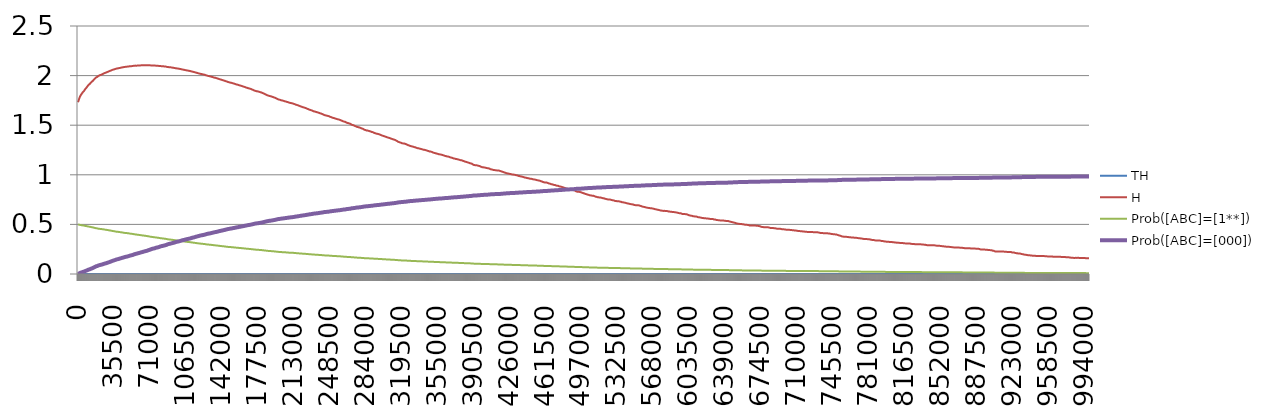
| Category | TH | H | Prob([ABC]=[1**]) | Prob([ABC]=[000]) |
|---|---|---|---|---|
| 0 | 0 | 1.732 | 0.499 | 0.001 |
| 500 | 0 | 1.746 | 0.499 | 0.003 |
| 1000 | 0 | 1.762 | 0.497 | 0.006 |
| 1500 | 0 | 1.777 | 0.496 | 0.008 |
| 2000 | 0 | 1.79 | 0.495 | 0.011 |
| 2500 | 0 | 1.797 | 0.494 | 0.012 |
| 3000 | 0 | 1.806 | 0.493 | 0.014 |
| 3500 | 0 | 1.813 | 0.492 | 0.016 |
| 4000 | 0 | 1.822 | 0.491 | 0.018 |
| 4500 | 0 | 1.83 | 0.49 | 0.02 |
| 5000 | 0 | 1.835 | 0.49 | 0.022 |
| 5500 | 0 | 1.84 | 0.488 | 0.023 |
| 6000 | 0 | 1.846 | 0.488 | 0.025 |
| 6500 | 0 | 1.854 | 0.487 | 0.027 |
| 7000 | 0 | 1.862 | 0.485 | 0.029 |
| 7500 | 0 | 1.87 | 0.484 | 0.032 |
| 8000 | 0 | 1.874 | 0.484 | 0.033 |
| 8500 | 0 | 1.881 | 0.483 | 0.035 |
| 9000 | 0 | 1.887 | 0.482 | 0.037 |
| 9500 | 0 | 1.894 | 0.48 | 0.039 |
| 10000 | 0 | 1.901 | 0.479 | 0.042 |
| 10500 | 0 | 1.907 | 0.478 | 0.044 |
| 11000 | 0 | 1.911 | 0.477 | 0.046 |
| 11500 | 0 | 1.915 | 0.477 | 0.047 |
| 12000 | 0 | 1.92 | 0.476 | 0.049 |
| 12500 | 0 | 1.925 | 0.474 | 0.052 |
| 13000 | 0 | 1.932 | 0.473 | 0.054 |
| 13500 | 0 | 1.936 | 0.472 | 0.056 |
| 14000 | 0 | 1.941 | 0.471 | 0.058 |
| 14500 | 0 | 1.946 | 0.471 | 0.06 |
| 15000 | 0 | 1.951 | 0.469 | 0.062 |
| 15500 | 0 | 1.956 | 0.468 | 0.065 |
| 16000 | 0 | 1.964 | 0.466 | 0.068 |
| 16500 | 0 | 1.968 | 0.464 | 0.071 |
| 17000 | 0 | 1.973 | 0.463 | 0.073 |
| 17500 | 0 | 1.978 | 0.462 | 0.076 |
| 18000 | 0 | 1.982 | 0.461 | 0.078 |
| 18500 | 0 | 1.985 | 0.461 | 0.079 |
| 19000 | 0 | 1.987 | 0.46 | 0.081 |
| 19500 | 0 | 1.993 | 0.458 | 0.084 |
| 20000 | 0 | 1.996 | 0.457 | 0.085 |
| 20500 | 0 | 1.998 | 0.456 | 0.087 |
| 21000 | 0 | 2.001 | 0.455 | 0.089 |
| 21500 | 0 | 2.004 | 0.456 | 0.09 |
| 22000 | 0 | 2.006 | 0.454 | 0.091 |
| 22500 | 0 | 2.007 | 0.454 | 0.092 |
| 23000 | 0 | 2.009 | 0.454 | 0.094 |
| 23500 | 0 | 2.011 | 0.452 | 0.095 |
| 24000 | 0 | 2.014 | 0.451 | 0.097 |
| 24500 | 0 | 2.017 | 0.451 | 0.098 |
| 25000 | 0 | 2.019 | 0.45 | 0.1 |
| 25500 | 0 | 2.022 | 0.45 | 0.102 |
| 26000 | 0 | 2.025 | 0.448 | 0.104 |
| 26500 | 0 | 2.027 | 0.447 | 0.106 |
| 27000 | 0 | 2.028 | 0.447 | 0.107 |
| 27500 | 0 | 2.03 | 0.446 | 0.108 |
| 28000 | 0 | 2.031 | 0.446 | 0.109 |
| 28500 | 0 | 2.035 | 0.444 | 0.112 |
| 29000 | 0 | 2.037 | 0.443 | 0.113 |
| 29500 | 0 | 2.039 | 0.443 | 0.115 |
| 30000 | 0 | 2.04 | 0.442 | 0.116 |
| 30500 | 0 | 2.043 | 0.441 | 0.119 |
| 31000 | 0 | 2.045 | 0.44 | 0.12 |
| 31500 | 0 | 2.047 | 0.439 | 0.122 |
| 32000 | 0 | 2.049 | 0.438 | 0.124 |
| 32500 | 0 | 2.052 | 0.436 | 0.127 |
| 33000 | 0 | 2.053 | 0.436 | 0.128 |
| 33500 | 0 | 2.056 | 0.435 | 0.13 |
| 34000 | 0 | 2.058 | 0.434 | 0.133 |
| 34500 | 0 | 2.059 | 0.434 | 0.134 |
| 35000 | 0 | 2.061 | 0.432 | 0.135 |
| 35500 | 0 | 2.062 | 0.431 | 0.137 |
| 36000 | 0 | 2.064 | 0.431 | 0.139 |
| 36500 | 0 | 2.065 | 0.43 | 0.141 |
| 37000 | 0 | 2.067 | 0.429 | 0.143 |
| 37500 | 0 | 2.069 | 0.428 | 0.144 |
| 38000 | 0 | 2.071 | 0.426 | 0.147 |
| 38500 | 0 | 2.072 | 0.426 | 0.148 |
| 39000 | 0 | 2.073 | 0.426 | 0.149 |
| 39500 | 0 | 2.073 | 0.425 | 0.15 |
| 40000 | 0 | 2.075 | 0.424 | 0.151 |
| 40500 | 0 | 2.076 | 0.423 | 0.153 |
| 41000 | 0 | 2.077 | 0.423 | 0.155 |
| 41500 | 0 | 2.078 | 0.422 | 0.156 |
| 42000 | 0 | 2.079 | 0.421 | 0.158 |
| 42500 | 0 | 2.08 | 0.42 | 0.159 |
| 43000 | 0 | 2.082 | 0.42 | 0.161 |
| 43500 | 0 | 2.082 | 0.418 | 0.162 |
| 44000 | 0 | 2.083 | 0.418 | 0.164 |
| 44500 | 0 | 2.084 | 0.417 | 0.165 |
| 45000 | 0 | 2.086 | 0.416 | 0.167 |
| 45500 | 0 | 2.086 | 0.416 | 0.168 |
| 46000 | 0 | 2.087 | 0.414 | 0.17 |
| 46500 | 0 | 2.088 | 0.414 | 0.172 |
| 47000 | 0 | 2.088 | 0.414 | 0.173 |
| 47500 | 0 | 2.09 | 0.413 | 0.174 |
| 48000 | 0 | 2.09 | 0.413 | 0.175 |
| 48500 | 0 | 2.09 | 0.412 | 0.176 |
| 49000 | 0 | 2.091 | 0.411 | 0.177 |
| 49500 | 0 | 2.092 | 0.41 | 0.179 |
| 50000 | 0 | 2.092 | 0.41 | 0.181 |
| 50500 | 0 | 2.093 | 0.408 | 0.183 |
| 51000 | 0 | 2.094 | 0.408 | 0.184 |
| 51500 | 0 | 2.094 | 0.407 | 0.185 |
| 52000 | 0 | 2.095 | 0.406 | 0.187 |
| 52500 | 0 | 2.096 | 0.406 | 0.188 |
| 53000 | 0 | 2.095 | 0.406 | 0.189 |
| 53500 | 0 | 2.096 | 0.405 | 0.19 |
| 54000 | 0 | 2.098 | 0.404 | 0.192 |
| 54500 | 0 | 2.098 | 0.403 | 0.194 |
| 55000 | 0 | 2.098 | 0.402 | 0.196 |
| 55500 | 0 | 2.099 | 0.4 | 0.198 |
| 56000 | 0 | 2.1 | 0.4 | 0.2 |
| 56500 | 0 | 2.1 | 0.399 | 0.202 |
| 57000 | 0 | 2.101 | 0.398 | 0.203 |
| 57500 | 0 | 2.101 | 0.398 | 0.204 |
| 58000 | 0 | 2.1 | 0.397 | 0.205 |
| 58500 | 0 | 2.101 | 0.396 | 0.207 |
| 59000 | 0 | 2.102 | 0.396 | 0.208 |
| 59500 | 0 | 2.102 | 0.395 | 0.21 |
| 60000 | 0 | 2.102 | 0.394 | 0.211 |
| 60500 | 0 | 2.102 | 0.394 | 0.213 |
| 61000 | 0 | 2.102 | 0.393 | 0.214 |
| 61500 | 0 | 2.103 | 0.392 | 0.215 |
| 62000 | 0 | 2.103 | 0.391 | 0.217 |
| 62500 | 0 | 2.103 | 0.391 | 0.218 |
| 63000 | 0 | 2.103 | 0.39 | 0.22 |
| 63500 | 0 | 2.104 | 0.389 | 0.221 |
| 64000 | 0 | 2.103 | 0.388 | 0.223 |
| 64500 | 0 | 2.104 | 0.387 | 0.225 |
| 65000 | 0 | 2.103 | 0.387 | 0.226 |
| 65500 | 0 | 2.104 | 0.386 | 0.228 |
| 66000 | 0 | 2.104 | 0.385 | 0.229 |
| 66500 | 0 | 2.104 | 0.385 | 0.23 |
| 67000 | 0 | 2.104 | 0.384 | 0.231 |
| 67500 | 0 | 2.104 | 0.384 | 0.232 |
| 68000 | 0 | 2.104 | 0.383 | 0.234 |
| 68500 | 0 | 2.104 | 0.382 | 0.236 |
| 69000 | 0 | 2.104 | 0.381 | 0.238 |
| 69500 | 0 | 2.103 | 0.38 | 0.24 |
| 70000 | 0 | 2.104 | 0.379 | 0.242 |
| 70500 | 0 | 2.103 | 0.378 | 0.243 |
| 71000 | 0 | 2.104 | 0.377 | 0.245 |
| 71500 | 0 | 2.103 | 0.376 | 0.247 |
| 72000 | 0 | 2.103 | 0.376 | 0.249 |
| 72500 | 0 | 2.103 | 0.374 | 0.251 |
| 73000 | 0 | 2.102 | 0.373 | 0.253 |
| 73500 | 0 | 2.102 | 0.373 | 0.254 |
| 74000 | 0 | 2.102 | 0.372 | 0.256 |
| 74500 | 0 | 2.101 | 0.372 | 0.257 |
| 75000 | 0 | 2.102 | 0.371 | 0.258 |
| 75500 | 0 | 2.101 | 0.37 | 0.259 |
| 76000 | 0 | 2.101 | 0.37 | 0.26 |
| 76500 | 0 | 2.101 | 0.369 | 0.262 |
| 77000 | 0 | 2.1 | 0.368 | 0.265 |
| 77500 | 0 | 2.1 | 0.368 | 0.265 |
| 78000 | 0 | 2.1 | 0.367 | 0.267 |
| 78500 | 0 | 2.099 | 0.366 | 0.268 |
| 79000 | 0 | 2.098 | 0.366 | 0.269 |
| 79500 | 0 | 2.098 | 0.365 | 0.271 |
| 80000 | 0 | 2.098 | 0.364 | 0.273 |
| 80500 | 0 | 2.098 | 0.363 | 0.274 |
| 81000 | 0 | 2.096 | 0.362 | 0.276 |
| 81500 | 0 | 2.096 | 0.361 | 0.278 |
| 82000 | 0 | 2.095 | 0.36 | 0.28 |
| 82500 | 0 | 2.095 | 0.359 | 0.281 |
| 83000 | 0 | 2.095 | 0.359 | 0.282 |
| 83500 | 0 | 2.094 | 0.358 | 0.283 |
| 84000 | 0 | 2.094 | 0.358 | 0.284 |
| 84500 | 0 | 2.093 | 0.357 | 0.286 |
| 85000 | 0 | 2.092 | 0.357 | 0.287 |
| 85500 | 0 | 2.093 | 0.356 | 0.288 |
| 86000 | 0 | 2.092 | 0.355 | 0.29 |
| 86500 | 0 | 2.091 | 0.355 | 0.291 |
| 87000 | 0 | 2.09 | 0.354 | 0.293 |
| 87500 | 0 | 2.089 | 0.352 | 0.295 |
| 88000 | 0 | 2.087 | 0.352 | 0.297 |
| 88500 | 0 | 2.087 | 0.35 | 0.299 |
| 89000 | 0 | 2.086 | 0.35 | 0.301 |
| 89500 | 0 | 2.086 | 0.349 | 0.302 |
| 90000 | 0 | 2.085 | 0.348 | 0.304 |
| 90500 | 0 | 2.084 | 0.347 | 0.305 |
| 91000 | 0 | 2.084 | 0.347 | 0.305 |
| 91500 | 0 | 2.083 | 0.346 | 0.307 |
| 92000 | 0 | 2.083 | 0.346 | 0.308 |
| 92500 | 0 | 2.082 | 0.345 | 0.309 |
| 93000 | 0 | 2.081 | 0.345 | 0.311 |
| 93500 | 0 | 2.08 | 0.344 | 0.312 |
| 94000 | 0 | 2.079 | 0.343 | 0.314 |
| 94500 | 0 | 2.078 | 0.342 | 0.315 |
| 95000 | 0 | 2.078 | 0.342 | 0.317 |
| 95500 | 0 | 2.076 | 0.341 | 0.318 |
| 96000 | 0 | 2.075 | 0.34 | 0.32 |
| 96500 | 0 | 2.075 | 0.339 | 0.321 |
| 97000 | 0 | 2.074 | 0.339 | 0.323 |
| 97500 | 0 | 2.072 | 0.338 | 0.324 |
| 98000 | 0 | 2.071 | 0.337 | 0.326 |
| 98500 | 0 | 2.071 | 0.337 | 0.327 |
| 99000 | 0 | 2.071 | 0.336 | 0.328 |
| 99500 | 0 | 2.07 | 0.335 | 0.329 |
| 100000 | 0 | 2.068 | 0.335 | 0.33 |
| 100500 | 0 | 2.068 | 0.334 | 0.331 |
| 101000 | 0 | 2.066 | 0.333 | 0.333 |
| 101500 | 0 | 2.065 | 0.333 | 0.335 |
| 102000 | 0 | 2.064 | 0.332 | 0.337 |
| 102500 | 0 | 2.062 | 0.331 | 0.339 |
| 103000 | 0 | 2.061 | 0.33 | 0.34 |
| 103500 | 0 | 2.06 | 0.329 | 0.341 |
| 104000 | 0 | 2.06 | 0.329 | 0.342 |
| 104500 | 0 | 2.059 | 0.328 | 0.343 |
| 105000 | 0 | 2.058 | 0.328 | 0.344 |
| 105500 | 0 | 2.056 | 0.327 | 0.346 |
| 106000 | 0 | 2.055 | 0.326 | 0.347 |
| 106500 | 0 | 2.054 | 0.325 | 0.349 |
| 107000 | 0 | 2.053 | 0.325 | 0.35 |
| 107500 | 0 | 2.053 | 0.325 | 0.351 |
| 108000 | 0 | 2.051 | 0.324 | 0.352 |
| 108500 | 0 | 2.05 | 0.323 | 0.354 |
| 109000 | 0 | 2.05 | 0.323 | 0.355 |
| 109500 | 0 | 2.048 | 0.322 | 0.356 |
| 110000 | 0 | 2.047 | 0.322 | 0.357 |
| 110500 | 0 | 2.047 | 0.321 | 0.358 |
| 111000 | 0 | 2.045 | 0.32 | 0.359 |
| 111500 | 0 | 2.044 | 0.32 | 0.361 |
| 112000 | 0 | 2.042 | 0.318 | 0.362 |
| 112500 | 0 | 2.04 | 0.318 | 0.365 |
| 113000 | 0 | 2.039 | 0.317 | 0.366 |
| 113500 | 0 | 2.038 | 0.316 | 0.367 |
| 114000 | 0 | 2.038 | 0.316 | 0.368 |
| 114500 | 0 | 2.036 | 0.316 | 0.369 |
| 115000 | 0 | 2.035 | 0.315 | 0.371 |
| 115500 | 0 | 2.033 | 0.314 | 0.372 |
| 116000 | 0 | 2.031 | 0.313 | 0.375 |
| 116500 | 0 | 2.03 | 0.312 | 0.376 |
| 117000 | 0 | 2.029 | 0.311 | 0.377 |
| 117500 | 0 | 2.027 | 0.311 | 0.378 |
| 118000 | 0 | 2.026 | 0.31 | 0.38 |
| 118500 | 0 | 2.025 | 0.309 | 0.381 |
| 119000 | 0 | 2.023 | 0.309 | 0.383 |
| 119500 | 0 | 2.022 | 0.308 | 0.384 |
| 120000 | 0 | 2.02 | 0.308 | 0.385 |
| 120500 | 0 | 2.018 | 0.307 | 0.387 |
| 121000 | 0 | 2.017 | 0.306 | 0.388 |
| 121500 | 0 | 2.016 | 0.305 | 0.389 |
| 122000 | 0 | 2.015 | 0.305 | 0.39 |
| 122500 | 0 | 2.015 | 0.305 | 0.391 |
| 123000 | 0 | 2.013 | 0.304 | 0.392 |
| 123500 | 0 | 2.011 | 0.303 | 0.393 |
| 124000 | 0 | 2.011 | 0.303 | 0.394 |
| 124500 | 0 | 2.01 | 0.303 | 0.395 |
| 125000 | 0 | 2.009 | 0.302 | 0.396 |
| 125500 | 0 | 2.007 | 0.301 | 0.398 |
| 126000 | 0 | 2.004 | 0.3 | 0.4 |
| 126500 | 0 | 2.002 | 0.299 | 0.402 |
| 127000 | 0 | 2.001 | 0.298 | 0.403 |
| 127500 | 0 | 1.999 | 0.298 | 0.404 |
| 128000 | 0 | 1.998 | 0.297 | 0.406 |
| 128500 | 0 | 1.996 | 0.297 | 0.407 |
| 129000 | 0 | 1.996 | 0.296 | 0.407 |
| 129500 | 0 | 1.994 | 0.296 | 0.408 |
| 130000 | 0 | 1.993 | 0.296 | 0.409 |
| 130500 | 0 | 1.992 | 0.295 | 0.41 |
| 131000 | 0 | 1.991 | 0.294 | 0.411 |
| 131500 | 0 | 1.99 | 0.293 | 0.413 |
| 132000 | 0 | 1.988 | 0.293 | 0.414 |
| 132500 | 0 | 1.986 | 0.292 | 0.415 |
| 133000 | 0 | 1.985 | 0.292 | 0.416 |
| 133500 | 0 | 1.984 | 0.291 | 0.417 |
| 134000 | 0 | 1.981 | 0.29 | 0.419 |
| 134500 | 0 | 1.979 | 0.29 | 0.42 |
| 135000 | 0 | 1.978 | 0.289 | 0.421 |
| 135500 | 0 | 1.977 | 0.289 | 0.422 |
| 136000 | 0 | 1.977 | 0.288 | 0.423 |
| 136500 | 0 | 1.976 | 0.288 | 0.424 |
| 137000 | 0 | 1.973 | 0.288 | 0.425 |
| 137500 | 0 | 1.972 | 0.287 | 0.426 |
| 138000 | 0 | 1.97 | 0.286 | 0.427 |
| 138500 | 0 | 1.968 | 0.285 | 0.429 |
| 139000 | 0 | 1.966 | 0.284 | 0.431 |
| 139500 | 0 | 1.965 | 0.284 | 0.432 |
| 140000 | 0 | 1.963 | 0.283 | 0.433 |
| 140500 | 0 | 1.961 | 0.283 | 0.434 |
| 141000 | 0 | 1.96 | 0.282 | 0.435 |
| 141500 | 0 | 1.959 | 0.282 | 0.436 |
| 142000 | 0 | 1.957 | 0.281 | 0.438 |
| 142500 | 0 | 1.955 | 0.28 | 0.439 |
| 143000 | 0 | 1.954 | 0.28 | 0.44 |
| 143500 | 0 | 1.953 | 0.28 | 0.441 |
| 144000 | 0 | 1.95 | 0.279 | 0.443 |
| 144500 | 0 | 1.949 | 0.279 | 0.444 |
| 145000 | 0 | 1.947 | 0.278 | 0.445 |
| 145500 | 0 | 1.945 | 0.276 | 0.447 |
| 146000 | 0 | 1.943 | 0.276 | 0.448 |
| 146500 | 0 | 1.941 | 0.276 | 0.449 |
| 147000 | 0 | 1.94 | 0.275 | 0.45 |
| 147500 | 0 | 1.938 | 0.274 | 0.451 |
| 148000 | 0 | 1.936 | 0.273 | 0.453 |
| 148500 | 0 | 1.935 | 0.273 | 0.454 |
| 149000 | 0 | 1.934 | 0.273 | 0.454 |
| 149500 | 0 | 1.932 | 0.272 | 0.455 |
| 150000 | 0 | 1.93 | 0.272 | 0.457 |
| 150500 | 0 | 1.929 | 0.271 | 0.457 |
| 151000 | 0 | 1.928 | 0.271 | 0.458 |
| 151500 | 0 | 1.927 | 0.271 | 0.459 |
| 152000 | 0 | 1.925 | 0.27 | 0.46 |
| 152500 | 0 | 1.924 | 0.27 | 0.461 |
| 153000 | 0 | 1.922 | 0.269 | 0.462 |
| 153500 | 0 | 1.92 | 0.268 | 0.463 |
| 154000 | 0 | 1.92 | 0.268 | 0.464 |
| 154500 | 0 | 1.918 | 0.267 | 0.465 |
| 155000 | 0 | 1.916 | 0.267 | 0.466 |
| 155500 | 0 | 1.914 | 0.266 | 0.467 |
| 156000 | 0 | 1.912 | 0.266 | 0.469 |
| 156500 | 0 | 1.91 | 0.265 | 0.47 |
| 157000 | 0 | 1.91 | 0.265 | 0.47 |
| 157500 | 0 | 1.909 | 0.264 | 0.471 |
| 158000 | 0 | 1.907 | 0.264 | 0.472 |
| 158500 | 0 | 1.905 | 0.263 | 0.473 |
| 159000 | 0 | 1.903 | 0.263 | 0.474 |
| 159500 | 0 | 1.902 | 0.263 | 0.475 |
| 160000 | 0 | 1.9 | 0.262 | 0.476 |
| 160500 | 0 | 1.899 | 0.261 | 0.477 |
| 161000 | 0 | 1.898 | 0.261 | 0.478 |
| 161500 | 0 | 1.896 | 0.26 | 0.479 |
| 162000 | 0 | 1.894 | 0.26 | 0.48 |
| 162500 | 0 | 1.892 | 0.26 | 0.481 |
| 163000 | 0 | 1.89 | 0.259 | 0.482 |
| 163500 | 0 | 1.889 | 0.258 | 0.483 |
| 164000 | 0 | 1.887 | 0.258 | 0.484 |
| 164500 | 0 | 1.886 | 0.257 | 0.485 |
| 165000 | 0 | 1.884 | 0.257 | 0.486 |
| 165500 | 0 | 1.882 | 0.256 | 0.488 |
| 166000 | 0 | 1.88 | 0.256 | 0.489 |
| 166500 | 0 | 1.878 | 0.255 | 0.49 |
| 167000 | 0 | 1.876 | 0.254 | 0.491 |
| 167500 | 0 | 1.874 | 0.254 | 0.492 |
| 168000 | 0 | 1.873 | 0.254 | 0.493 |
| 168500 | 0 | 1.871 | 0.253 | 0.494 |
| 169000 | 0 | 1.87 | 0.253 | 0.495 |
| 169500 | 0 | 1.869 | 0.252 | 0.495 |
| 170000 | 0 | 1.867 | 0.252 | 0.496 |
| 170500 | 0 | 1.866 | 0.251 | 0.497 |
| 171000 | 0 | 1.864 | 0.25 | 0.499 |
| 171500 | 0 | 1.861 | 0.25 | 0.5 |
| 172000 | 0 | 1.859 | 0.25 | 0.501 |
| 172500 | 0 | 1.858 | 0.249 | 0.502 |
| 173000 | 0 | 1.855 | 0.248 | 0.503 |
| 173500 | 0 | 1.853 | 0.248 | 0.505 |
| 174000 | 0 | 1.85 | 0.247 | 0.506 |
| 174500 | 0 | 1.849 | 0.246 | 0.507 |
| 175000 | 0 | 1.846 | 0.246 | 0.508 |
| 175500 | 0 | 1.845 | 0.245 | 0.509 |
| 176000 | 0 | 1.843 | 0.245 | 0.51 |
| 176500 | 0 | 1.842 | 0.245 | 0.511 |
| 177000 | 0 | 1.842 | 0.245 | 0.511 |
| 177500 | 0 | 1.84 | 0.244 | 0.512 |
| 178000 | 0 | 1.839 | 0.244 | 0.512 |
| 178500 | 0 | 1.838 | 0.243 | 0.513 |
| 179000 | 0 | 1.836 | 0.243 | 0.514 |
| 179500 | 0 | 1.834 | 0.243 | 0.515 |
| 180000 | 0 | 1.833 | 0.242 | 0.516 |
| 180500 | 0 | 1.831 | 0.242 | 0.517 |
| 181000 | 0 | 1.83 | 0.241 | 0.518 |
| 181500 | 0 | 1.828 | 0.241 | 0.519 |
| 182000 | 0 | 1.826 | 0.24 | 0.52 |
| 182500 | 0 | 1.823 | 0.239 | 0.521 |
| 183000 | 0 | 1.821 | 0.239 | 0.522 |
| 183500 | 0 | 1.819 | 0.238 | 0.524 |
| 184000 | 0 | 1.816 | 0.237 | 0.525 |
| 184500 | 0 | 1.814 | 0.237 | 0.526 |
| 185000 | 0 | 1.812 | 0.236 | 0.527 |
| 185500 | 0 | 1.809 | 0.236 | 0.529 |
| 186000 | 0 | 1.806 | 0.235 | 0.53 |
| 186500 | 0 | 1.803 | 0.234 | 0.532 |
| 187000 | 0 | 1.802 | 0.234 | 0.533 |
| 187500 | 0 | 1.8 | 0.233 | 0.534 |
| 188000 | 0 | 1.798 | 0.233 | 0.535 |
| 188500 | 0 | 1.796 | 0.232 | 0.536 |
| 189000 | 0 | 1.794 | 0.232 | 0.536 |
| 189500 | 0 | 1.793 | 0.232 | 0.537 |
| 190000 | 0 | 1.792 | 0.231 | 0.538 |
| 190500 | 0 | 1.791 | 0.231 | 0.538 |
| 191000 | 0 | 1.789 | 0.23 | 0.539 |
| 191500 | 0 | 1.787 | 0.23 | 0.54 |
| 192000 | 0 | 1.786 | 0.23 | 0.541 |
| 192500 | 0 | 1.784 | 0.229 | 0.542 |
| 193000 | 0 | 1.782 | 0.229 | 0.543 |
| 193500 | 0 | 1.78 | 0.228 | 0.544 |
| 194000 | 0 | 1.778 | 0.228 | 0.545 |
| 194500 | 0 | 1.776 | 0.227 | 0.546 |
| 195000 | 0 | 1.774 | 0.227 | 0.547 |
| 195500 | 0 | 1.771 | 0.226 | 0.548 |
| 196000 | 0 | 1.769 | 0.225 | 0.549 |
| 196500 | 0 | 1.766 | 0.225 | 0.551 |
| 197000 | 0 | 1.764 | 0.224 | 0.552 |
| 197500 | 0 | 1.762 | 0.224 | 0.553 |
| 198000 | 0 | 1.759 | 0.223 | 0.554 |
| 198500 | 0 | 1.758 | 0.223 | 0.555 |
| 199000 | 0 | 1.757 | 0.222 | 0.555 |
| 199500 | 0 | 1.755 | 0.222 | 0.556 |
| 200000 | 0 | 1.753 | 0.221 | 0.557 |
| 200500 | 0 | 1.752 | 0.221 | 0.558 |
| 201000 | 0 | 1.75 | 0.221 | 0.559 |
| 201500 | 0 | 1.749 | 0.22 | 0.559 |
| 202000 | 0 | 1.748 | 0.22 | 0.56 |
| 202500 | 0 | 1.746 | 0.219 | 0.56 |
| 203000 | 0 | 1.745 | 0.219 | 0.561 |
| 203500 | 0 | 1.742 | 0.219 | 0.562 |
| 204000 | 0 | 1.741 | 0.219 | 0.563 |
| 204500 | 0 | 1.741 | 0.218 | 0.563 |
| 205000 | 0 | 1.739 | 0.218 | 0.564 |
| 205500 | 0 | 1.737 | 0.218 | 0.565 |
| 206000 | 0 | 1.736 | 0.217 | 0.566 |
| 206500 | 0 | 1.734 | 0.217 | 0.566 |
| 207000 | 0 | 1.734 | 0.217 | 0.567 |
| 207500 | 0 | 1.732 | 0.216 | 0.567 |
| 208000 | 0 | 1.729 | 0.215 | 0.569 |
| 208500 | 0 | 1.728 | 0.216 | 0.569 |
| 209000 | 0 | 1.726 | 0.215 | 0.57 |
| 209500 | 0 | 1.725 | 0.215 | 0.571 |
| 210000 | 0 | 1.723 | 0.214 | 0.571 |
| 210500 | 0 | 1.722 | 0.214 | 0.572 |
| 211000 | 0 | 1.722 | 0.214 | 0.572 |
| 211500 | 0 | 1.719 | 0.213 | 0.573 |
| 212000 | 0 | 1.719 | 0.214 | 0.573 |
| 212500 | 0 | 1.718 | 0.213 | 0.574 |
| 213000 | 0 | 1.716 | 0.213 | 0.575 |
| 213500 | 0 | 1.714 | 0.212 | 0.576 |
| 214000 | 0 | 1.712 | 0.212 | 0.577 |
| 214500 | 0 | 1.708 | 0.211 | 0.578 |
| 215000 | 0 | 1.707 | 0.211 | 0.579 |
| 215500 | 0 | 1.706 | 0.21 | 0.579 |
| 216000 | 0 | 1.704 | 0.21 | 0.58 |
| 216500 | 0 | 1.702 | 0.21 | 0.581 |
| 217000 | 0 | 1.701 | 0.209 | 0.582 |
| 217500 | 0 | 1.699 | 0.209 | 0.582 |
| 218000 | 0 | 1.697 | 0.208 | 0.583 |
| 218500 | 0 | 1.695 | 0.208 | 0.584 |
| 219000 | 0 | 1.693 | 0.207 | 0.585 |
| 219500 | 0 | 1.691 | 0.207 | 0.586 |
| 220000 | 0 | 1.689 | 0.206 | 0.587 |
| 220500 | 0 | 1.688 | 0.206 | 0.587 |
| 221000 | 0 | 1.686 | 0.206 | 0.589 |
| 221500 | 0 | 1.684 | 0.205 | 0.589 |
| 222000 | 0 | 1.681 | 0.205 | 0.591 |
| 222500 | 0 | 1.681 | 0.205 | 0.591 |
| 223000 | 0 | 1.679 | 0.204 | 0.591 |
| 223500 | 0 | 1.677 | 0.204 | 0.593 |
| 224000 | 0 | 1.675 | 0.204 | 0.593 |
| 224500 | 0 | 1.673 | 0.203 | 0.594 |
| 225000 | 0 | 1.672 | 0.203 | 0.595 |
| 225500 | 0 | 1.67 | 0.202 | 0.595 |
| 226000 | 0 | 1.667 | 0.201 | 0.597 |
| 226500 | 0 | 1.664 | 0.201 | 0.598 |
| 227000 | 0 | 1.663 | 0.201 | 0.598 |
| 227500 | 0 | 1.662 | 0.2 | 0.599 |
| 228000 | 0 | 1.658 | 0.2 | 0.601 |
| 228500 | 0 | 1.657 | 0.199 | 0.601 |
| 229000 | 0 | 1.655 | 0.199 | 0.602 |
| 229500 | 0 | 1.654 | 0.199 | 0.603 |
| 230000 | 0 | 1.651 | 0.198 | 0.603 |
| 230500 | 0 | 1.65 | 0.198 | 0.604 |
| 231000 | 0 | 1.648 | 0.197 | 0.605 |
| 231500 | 0 | 1.645 | 0.197 | 0.606 |
| 232000 | 0 | 1.643 | 0.196 | 0.607 |
| 232500 | 0 | 1.641 | 0.196 | 0.608 |
| 233000 | 0 | 1.639 | 0.196 | 0.609 |
| 233500 | 0 | 1.638 | 0.196 | 0.609 |
| 234000 | 0 | 1.637 | 0.195 | 0.61 |
| 234500 | 0 | 1.635 | 0.195 | 0.61 |
| 235000 | 0 | 1.634 | 0.194 | 0.611 |
| 235500 | 0 | 1.632 | 0.194 | 0.612 |
| 236000 | 0 | 1.631 | 0.194 | 0.612 |
| 236500 | 0 | 1.629 | 0.193 | 0.613 |
| 237000 | 0 | 1.628 | 0.193 | 0.614 |
| 237500 | 0 | 1.626 | 0.193 | 0.614 |
| 238000 | 0 | 1.624 | 0.192 | 0.615 |
| 238500 | 0 | 1.622 | 0.192 | 0.616 |
| 239000 | 0 | 1.62 | 0.192 | 0.617 |
| 239500 | 0 | 1.618 | 0.191 | 0.618 |
| 240000 | 0 | 1.617 | 0.191 | 0.618 |
| 240500 | 0 | 1.615 | 0.19 | 0.619 |
| 241000 | 0 | 1.613 | 0.19 | 0.62 |
| 241500 | 0 | 1.612 | 0.19 | 0.62 |
| 242000 | 0 | 1.609 | 0.189 | 0.621 |
| 242500 | 0 | 1.606 | 0.189 | 0.623 |
| 243000 | 0 | 1.603 | 0.188 | 0.624 |
| 243500 | 0 | 1.601 | 0.188 | 0.625 |
| 244000 | 0 | 1.6 | 0.187 | 0.625 |
| 244500 | 0 | 1.599 | 0.187 | 0.625 |
| 245000 | 0 | 1.598 | 0.187 | 0.626 |
| 245500 | 0 | 1.596 | 0.187 | 0.627 |
| 246000 | 0 | 1.595 | 0.186 | 0.627 |
| 246500 | 0 | 1.594 | 0.186 | 0.627 |
| 247000 | 0 | 1.593 | 0.186 | 0.628 |
| 247500 | 0 | 1.591 | 0.186 | 0.628 |
| 248000 | 0 | 1.59 | 0.185 | 0.629 |
| 248500 | 0 | 1.587 | 0.185 | 0.63 |
| 249000 | 0 | 1.584 | 0.184 | 0.631 |
| 249500 | 0 | 1.582 | 0.184 | 0.632 |
| 250000 | 0 | 1.581 | 0.184 | 0.633 |
| 250500 | 0 | 1.578 | 0.183 | 0.634 |
| 251000 | 0 | 1.577 | 0.183 | 0.634 |
| 251500 | 0 | 1.574 | 0.183 | 0.635 |
| 252000 | 0 | 1.573 | 0.182 | 0.636 |
| 252500 | 0 | 1.572 | 0.182 | 0.636 |
| 253000 | 0 | 1.571 | 0.182 | 0.637 |
| 253500 | 0 | 1.569 | 0.181 | 0.637 |
| 254000 | 0 | 1.567 | 0.181 | 0.638 |
| 254500 | 0 | 1.566 | 0.181 | 0.639 |
| 255000 | 0 | 1.564 | 0.18 | 0.639 |
| 255500 | 0 | 1.563 | 0.18 | 0.64 |
| 256000 | 0 | 1.56 | 0.18 | 0.641 |
| 256500 | 0 | 1.559 | 0.179 | 0.641 |
| 257000 | 0 | 1.558 | 0.179 | 0.642 |
| 257500 | 0 | 1.557 | 0.179 | 0.642 |
| 258000 | 0 | 1.556 | 0.179 | 0.643 |
| 258500 | 0 | 1.555 | 0.178 | 0.643 |
| 259000 | 0 | 1.552 | 0.178 | 0.644 |
| 259500 | 0 | 1.549 | 0.177 | 0.645 |
| 260000 | 0 | 1.546 | 0.177 | 0.646 |
| 260500 | 0 | 1.545 | 0.177 | 0.647 |
| 261000 | 0 | 1.543 | 0.176 | 0.648 |
| 261500 | 0 | 1.541 | 0.176 | 0.648 |
| 262000 | 0 | 1.538 | 0.175 | 0.649 |
| 262500 | 0 | 1.536 | 0.175 | 0.65 |
| 263000 | 0 | 1.535 | 0.175 | 0.651 |
| 263500 | 0 | 1.534 | 0.174 | 0.651 |
| 264000 | 0 | 1.534 | 0.174 | 0.651 |
| 264500 | 0 | 1.53 | 0.174 | 0.652 |
| 265000 | 0 | 1.526 | 0.173 | 0.654 |
| 265500 | 0 | 1.525 | 0.172 | 0.655 |
| 266000 | 0 | 1.523 | 0.172 | 0.655 |
| 266500 | 0 | 1.521 | 0.172 | 0.656 |
| 267000 | 0 | 1.521 | 0.172 | 0.656 |
| 267500 | 0 | 1.519 | 0.172 | 0.657 |
| 268000 | 0 | 1.517 | 0.171 | 0.658 |
| 268500 | 0 | 1.515 | 0.171 | 0.658 |
| 269000 | 0 | 1.514 | 0.171 | 0.659 |
| 269500 | 0 | 1.51 | 0.17 | 0.66 |
| 270000 | 0 | 1.505 | 0.169 | 0.662 |
| 270500 | 0 | 1.503 | 0.168 | 0.663 |
| 271000 | 0 | 1.502 | 0.168 | 0.663 |
| 271500 | 0 | 1.501 | 0.168 | 0.664 |
| 272000 | 0 | 1.499 | 0.168 | 0.664 |
| 272500 | 0 | 1.496 | 0.167 | 0.665 |
| 273000 | 0 | 1.494 | 0.167 | 0.666 |
| 273500 | 0 | 1.493 | 0.167 | 0.667 |
| 274000 | 0 | 1.49 | 0.166 | 0.667 |
| 274500 | 0 | 1.488 | 0.166 | 0.668 |
| 275000 | 0 | 1.484 | 0.165 | 0.67 |
| 275500 | 0 | 1.483 | 0.165 | 0.67 |
| 276000 | 0 | 1.482 | 0.165 | 0.67 |
| 276500 | 0 | 1.481 | 0.164 | 0.671 |
| 277000 | 0 | 1.48 | 0.164 | 0.671 |
| 277500 | 0 | 1.478 | 0.164 | 0.672 |
| 278000 | 0 | 1.476 | 0.164 | 0.673 |
| 278500 | 0 | 1.475 | 0.164 | 0.673 |
| 279000 | 0 | 1.473 | 0.163 | 0.674 |
| 279500 | 0 | 1.47 | 0.162 | 0.675 |
| 280000 | 0 | 1.467 | 0.162 | 0.676 |
| 280500 | 0 | 1.466 | 0.162 | 0.676 |
| 281000 | 0 | 1.465 | 0.162 | 0.677 |
| 281500 | 0 | 1.461 | 0.161 | 0.678 |
| 282000 | 0 | 1.459 | 0.16 | 0.679 |
| 282500 | 0 | 1.455 | 0.16 | 0.68 |
| 283000 | 0 | 1.453 | 0.16 | 0.681 |
| 283500 | 0 | 1.452 | 0.159 | 0.681 |
| 284000 | 0 | 1.45 | 0.159 | 0.682 |
| 284500 | 0 | 1.448 | 0.159 | 0.683 |
| 285000 | 0 | 1.446 | 0.158 | 0.683 |
| 285500 | 0 | 1.446 | 0.158 | 0.683 |
| 286000 | 0 | 1.446 | 0.158 | 0.684 |
| 286500 | 0 | 1.444 | 0.158 | 0.684 |
| 287000 | 0 | 1.443 | 0.158 | 0.685 |
| 287500 | 0 | 1.441 | 0.157 | 0.685 |
| 288000 | 0 | 1.439 | 0.157 | 0.686 |
| 288500 | 0 | 1.438 | 0.156 | 0.686 |
| 289000 | 0 | 1.436 | 0.157 | 0.687 |
| 289500 | 0 | 1.434 | 0.156 | 0.688 |
| 290000 | 0 | 1.432 | 0.156 | 0.688 |
| 290500 | 0 | 1.431 | 0.156 | 0.688 |
| 291000 | 0 | 1.43 | 0.156 | 0.689 |
| 291500 | 0 | 1.427 | 0.155 | 0.69 |
| 292000 | 0 | 1.424 | 0.155 | 0.691 |
| 292500 | 0 | 1.422 | 0.154 | 0.692 |
| 293000 | 0 | 1.421 | 0.154 | 0.692 |
| 293500 | 0 | 1.419 | 0.153 | 0.693 |
| 294000 | 0 | 1.417 | 0.153 | 0.694 |
| 294500 | 0 | 1.415 | 0.153 | 0.694 |
| 295000 | 0 | 1.414 | 0.153 | 0.694 |
| 295500 | 0 | 1.413 | 0.152 | 0.695 |
| 296000 | 0 | 1.412 | 0.153 | 0.695 |
| 296500 | 0 | 1.41 | 0.152 | 0.696 |
| 297000 | 0 | 1.409 | 0.152 | 0.696 |
| 297500 | 0 | 1.407 | 0.152 | 0.697 |
| 298000 | 0 | 1.406 | 0.152 | 0.698 |
| 298500 | 0 | 1.403 | 0.151 | 0.698 |
| 299000 | 0 | 1.401 | 0.15 | 0.699 |
| 299500 | 0 | 1.398 | 0.15 | 0.7 |
| 300000 | 0 | 1.397 | 0.15 | 0.7 |
| 300500 | 0 | 1.395 | 0.15 | 0.701 |
| 301000 | 0 | 1.393 | 0.149 | 0.702 |
| 301500 | 0 | 1.391 | 0.149 | 0.702 |
| 302000 | 0 | 1.39 | 0.148 | 0.702 |
| 302500 | 0 | 1.389 | 0.149 | 0.703 |
| 303000 | 0 | 1.386 | 0.148 | 0.704 |
| 303500 | 0 | 1.384 | 0.148 | 0.705 |
| 304000 | 0 | 1.383 | 0.148 | 0.705 |
| 304500 | 0 | 1.38 | 0.147 | 0.706 |
| 305000 | 0 | 1.379 | 0.147 | 0.706 |
| 305500 | 0 | 1.378 | 0.146 | 0.707 |
| 306000 | 0 | 1.375 | 0.146 | 0.708 |
| 306500 | 0 | 1.374 | 0.146 | 0.708 |
| 307000 | 0 | 1.373 | 0.146 | 0.708 |
| 307500 | 0 | 1.372 | 0.146 | 0.709 |
| 308000 | 0 | 1.369 | 0.145 | 0.71 |
| 308500 | 0 | 1.367 | 0.145 | 0.71 |
| 309000 | 0 | 1.365 | 0.144 | 0.711 |
| 309500 | 0 | 1.363 | 0.144 | 0.712 |
| 310000 | 0 | 1.362 | 0.144 | 0.712 |
| 310500 | 0 | 1.36 | 0.144 | 0.713 |
| 311000 | 0 | 1.358 | 0.143 | 0.714 |
| 311500 | 0 | 1.356 | 0.143 | 0.714 |
| 312000 | 0 | 1.355 | 0.143 | 0.714 |
| 312500 | 0 | 1.353 | 0.142 | 0.715 |
| 313000 | 0 | 1.351 | 0.142 | 0.716 |
| 313500 | 0 | 1.35 | 0.142 | 0.716 |
| 314000 | 0 | 1.346 | 0.142 | 0.717 |
| 314500 | 0 | 1.343 | 0.141 | 0.718 |
| 315000 | 0 | 1.34 | 0.14 | 0.719 |
| 315500 | 0 | 1.336 | 0.14 | 0.72 |
| 316000 | 0 | 1.333 | 0.14 | 0.721 |
| 316500 | 0 | 1.329 | 0.139 | 0.723 |
| 317000 | 0 | 1.33 | 0.138 | 0.723 |
| 317500 | 0 | 1.329 | 0.138 | 0.723 |
| 318000 | 0 | 1.326 | 0.138 | 0.724 |
| 318500 | 0 | 1.323 | 0.138 | 0.725 |
| 319000 | 0 | 1.322 | 0.137 | 0.725 |
| 319500 | 0 | 1.32 | 0.137 | 0.726 |
| 320000 | 0 | 1.318 | 0.137 | 0.726 |
| 320500 | 0 | 1.317 | 0.136 | 0.727 |
| 321000 | 0 | 1.316 | 0.137 | 0.727 |
| 321500 | 0 | 1.315 | 0.136 | 0.727 |
| 322000 | 0 | 1.315 | 0.136 | 0.727 |
| 322500 | 0 | 1.315 | 0.137 | 0.727 |
| 323000 | 0 | 1.312 | 0.136 | 0.728 |
| 323500 | 0 | 1.31 | 0.136 | 0.729 |
| 324000 | 0 | 1.308 | 0.135 | 0.729 |
| 324500 | 0 | 1.305 | 0.135 | 0.73 |
| 325000 | 0 | 1.303 | 0.134 | 0.731 |
| 325500 | 0 | 1.302 | 0.134 | 0.732 |
| 326000 | 0 | 1.298 | 0.134 | 0.733 |
| 326500 | 0 | 1.296 | 0.133 | 0.733 |
| 327000 | 0 | 1.295 | 0.134 | 0.734 |
| 327500 | 0 | 1.294 | 0.133 | 0.734 |
| 328000 | 0 | 1.29 | 0.133 | 0.735 |
| 328500 | 0 | 1.288 | 0.132 | 0.736 |
| 329000 | 0 | 1.288 | 0.132 | 0.736 |
| 329500 | 0 | 1.286 | 0.132 | 0.736 |
| 330000 | 0 | 1.285 | 0.132 | 0.737 |
| 330500 | 0 | 1.285 | 0.132 | 0.737 |
| 331000 | 0 | 1.283 | 0.131 | 0.737 |
| 331500 | 0 | 1.28 | 0.131 | 0.738 |
| 332000 | 0 | 1.279 | 0.131 | 0.739 |
| 332500 | 0 | 1.278 | 0.131 | 0.739 |
| 333000 | 0 | 1.277 | 0.131 | 0.739 |
| 333500 | 0 | 1.276 | 0.13 | 0.74 |
| 334000 | 0 | 1.272 | 0.13 | 0.741 |
| 334500 | 0 | 1.27 | 0.129 | 0.741 |
| 335000 | 0 | 1.269 | 0.129 | 0.742 |
| 335500 | 0 | 1.268 | 0.129 | 0.742 |
| 336000 | 0 | 1.268 | 0.129 | 0.742 |
| 336500 | 0 | 1.266 | 0.129 | 0.743 |
| 337000 | 0 | 1.264 | 0.128 | 0.743 |
| 337500 | 0 | 1.263 | 0.128 | 0.744 |
| 338000 | 0 | 1.262 | 0.128 | 0.744 |
| 338500 | 0 | 1.26 | 0.128 | 0.744 |
| 339000 | 0 | 1.259 | 0.128 | 0.745 |
| 339500 | 0 | 1.258 | 0.128 | 0.745 |
| 340000 | 0 | 1.256 | 0.127 | 0.746 |
| 340500 | 0 | 1.254 | 0.127 | 0.746 |
| 341000 | 0 | 1.253 | 0.127 | 0.747 |
| 341500 | 0 | 1.252 | 0.126 | 0.747 |
| 342000 | 0 | 1.252 | 0.127 | 0.747 |
| 342500 | 0 | 1.251 | 0.126 | 0.747 |
| 343000 | 0 | 1.249 | 0.126 | 0.748 |
| 343500 | 0 | 1.247 | 0.126 | 0.748 |
| 344000 | 0 | 1.246 | 0.126 | 0.749 |
| 344500 | 0 | 1.244 | 0.125 | 0.749 |
| 345000 | 0 | 1.242 | 0.125 | 0.75 |
| 345500 | 0 | 1.241 | 0.125 | 0.75 |
| 346000 | 0 | 1.24 | 0.125 | 0.751 |
| 346500 | 0 | 1.238 | 0.124 | 0.751 |
| 347000 | 0 | 1.235 | 0.124 | 0.752 |
| 347500 | 0 | 1.234 | 0.124 | 0.752 |
| 348000 | 0 | 1.234 | 0.124 | 0.752 |
| 348500 | 0 | 1.233 | 0.124 | 0.753 |
| 349000 | 0 | 1.231 | 0.123 | 0.753 |
| 349500 | 0 | 1.23 | 0.123 | 0.754 |
| 350000 | 0 | 1.227 | 0.123 | 0.754 |
| 350500 | 0 | 1.225 | 0.123 | 0.755 |
| 351000 | 0 | 1.223 | 0.122 | 0.756 |
| 351500 | 0 | 1.221 | 0.122 | 0.756 |
| 352000 | 0 | 1.22 | 0.122 | 0.757 |
| 352500 | 0 | 1.219 | 0.121 | 0.757 |
| 353000 | 0 | 1.218 | 0.121 | 0.757 |
| 353500 | 0 | 1.216 | 0.122 | 0.758 |
| 354000 | 0 | 1.214 | 0.121 | 0.758 |
| 354500 | 0 | 1.212 | 0.121 | 0.759 |
| 355000 | 0 | 1.212 | 0.121 | 0.759 |
| 355500 | 0 | 1.209 | 0.12 | 0.76 |
| 356000 | 0 | 1.208 | 0.12 | 0.76 |
| 356500 | 0 | 1.207 | 0.12 | 0.76 |
| 357000 | 0 | 1.206 | 0.12 | 0.761 |
| 357500 | 0 | 1.204 | 0.119 | 0.761 |
| 358000 | 0 | 1.204 | 0.12 | 0.761 |
| 358500 | 0 | 1.203 | 0.119 | 0.761 |
| 359000 | 0 | 1.202 | 0.119 | 0.762 |
| 359500 | 0 | 1.2 | 0.119 | 0.762 |
| 360000 | 0 | 1.199 | 0.118 | 0.763 |
| 360500 | 0 | 1.198 | 0.118 | 0.763 |
| 361000 | 0 | 1.196 | 0.118 | 0.764 |
| 361500 | 0 | 1.193 | 0.118 | 0.765 |
| 362000 | 0 | 1.191 | 0.118 | 0.765 |
| 362500 | 0 | 1.19 | 0.117 | 0.765 |
| 363000 | 0 | 1.189 | 0.117 | 0.766 |
| 363500 | 0 | 1.188 | 0.117 | 0.766 |
| 364000 | 0 | 1.186 | 0.117 | 0.767 |
| 364500 | 0 | 1.186 | 0.117 | 0.767 |
| 365000 | 0 | 1.184 | 0.117 | 0.767 |
| 365500 | 0 | 1.184 | 0.116 | 0.767 |
| 366000 | 0 | 1.182 | 0.116 | 0.768 |
| 366500 | 0 | 1.18 | 0.116 | 0.768 |
| 367000 | 0 | 1.178 | 0.116 | 0.769 |
| 367500 | 0 | 1.177 | 0.115 | 0.769 |
| 368000 | 0 | 1.174 | 0.115 | 0.77 |
| 368500 | 0 | 1.173 | 0.115 | 0.77 |
| 369000 | 0 | 1.172 | 0.115 | 0.77 |
| 369500 | 0 | 1.172 | 0.115 | 0.771 |
| 370000 | 0 | 1.168 | 0.114 | 0.772 |
| 370500 | 0 | 1.166 | 0.114 | 0.772 |
| 371000 | 0 | 1.164 | 0.114 | 0.773 |
| 371500 | 0 | 1.164 | 0.114 | 0.773 |
| 372000 | 0 | 1.163 | 0.113 | 0.773 |
| 372500 | 0 | 1.161 | 0.113 | 0.774 |
| 373000 | 0 | 1.159 | 0.113 | 0.774 |
| 373500 | 0 | 1.158 | 0.113 | 0.775 |
| 374000 | 0 | 1.158 | 0.113 | 0.775 |
| 374500 | 0 | 1.156 | 0.113 | 0.775 |
| 375000 | 0 | 1.156 | 0.112 | 0.775 |
| 375500 | 0 | 1.155 | 0.112 | 0.776 |
| 376000 | 0 | 1.153 | 0.112 | 0.776 |
| 376500 | 0 | 1.152 | 0.112 | 0.776 |
| 377000 | 0 | 1.149 | 0.112 | 0.777 |
| 377500 | 0 | 1.148 | 0.111 | 0.777 |
| 378000 | 0 | 1.146 | 0.111 | 0.778 |
| 378500 | 0 | 1.145 | 0.111 | 0.778 |
| 379000 | 0 | 1.145 | 0.111 | 0.778 |
| 379500 | 0 | 1.144 | 0.111 | 0.779 |
| 380000 | 0 | 1.14 | 0.11 | 0.78 |
| 380500 | 0 | 1.138 | 0.11 | 0.78 |
| 381000 | 0 | 1.138 | 0.11 | 0.78 |
| 381500 | 0 | 1.136 | 0.109 | 0.781 |
| 382000 | 0 | 1.132 | 0.109 | 0.782 |
| 382500 | 0 | 1.131 | 0.109 | 0.782 |
| 383000 | 0 | 1.13 | 0.109 | 0.782 |
| 383500 | 0 | 1.128 | 0.109 | 0.783 |
| 384000 | 0 | 1.127 | 0.108 | 0.783 |
| 384500 | 0 | 1.125 | 0.108 | 0.784 |
| 385000 | 0 | 1.124 | 0.108 | 0.784 |
| 385500 | 0 | 1.123 | 0.108 | 0.784 |
| 386000 | 0 | 1.12 | 0.107 | 0.785 |
| 386500 | 0 | 1.118 | 0.107 | 0.786 |
| 387000 | 0 | 1.116 | 0.107 | 0.786 |
| 387500 | 0 | 1.115 | 0.107 | 0.787 |
| 388000 | 0 | 1.114 | 0.107 | 0.787 |
| 388500 | 0 | 1.113 | 0.106 | 0.787 |
| 389000 | 0 | 1.111 | 0.106 | 0.788 |
| 389500 | 0 | 1.109 | 0.106 | 0.788 |
| 390000 | 0 | 1.102 | 0.105 | 0.79 |
| 390500 | 0 | 1.101 | 0.104 | 0.791 |
| 391000 | 0 | 1.099 | 0.104 | 0.791 |
| 391500 | 0 | 1.098 | 0.104 | 0.791 |
| 392000 | 0 | 1.097 | 0.104 | 0.792 |
| 392500 | 0 | 1.097 | 0.104 | 0.792 |
| 393000 | 0 | 1.096 | 0.104 | 0.792 |
| 393500 | 0 | 1.096 | 0.104 | 0.792 |
| 394000 | 0 | 1.095 | 0.104 | 0.792 |
| 394500 | 0 | 1.093 | 0.104 | 0.793 |
| 395000 | 0 | 1.091 | 0.103 | 0.793 |
| 395500 | 0 | 1.09 | 0.103 | 0.794 |
| 396000 | 0 | 1.089 | 0.103 | 0.794 |
| 396500 | 0 | 1.088 | 0.103 | 0.794 |
| 397000 | 0 | 1.086 | 0.103 | 0.795 |
| 397500 | 0 | 1.085 | 0.103 | 0.795 |
| 398000 | 0 | 1.081 | 0.102 | 0.796 |
| 398500 | 0 | 1.078 | 0.102 | 0.797 |
| 399000 | 0 | 1.076 | 0.102 | 0.797 |
| 399500 | 0 | 1.076 | 0.101 | 0.797 |
| 400000 | 0 | 1.076 | 0.101 | 0.797 |
| 400500 | 0 | 1.075 | 0.101 | 0.798 |
| 401000 | 0 | 1.074 | 0.101 | 0.798 |
| 401500 | 0 | 1.073 | 0.101 | 0.798 |
| 402000 | 0 | 1.072 | 0.101 | 0.798 |
| 402500 | 0 | 1.071 | 0.101 | 0.799 |
| 403000 | 0 | 1.069 | 0.1 | 0.799 |
| 403500 | 0 | 1.068 | 0.1 | 0.8 |
| 404000 | 0 | 1.067 | 0.1 | 0.8 |
| 404500 | 0 | 1.066 | 0.1 | 0.8 |
| 405000 | 0 | 1.065 | 0.1 | 0.8 |
| 405500 | 0 | 1.064 | 0.1 | 0.8 |
| 406000 | 0 | 1.063 | 0.1 | 0.801 |
| 406500 | 0 | 1.062 | 0.099 | 0.801 |
| 407000 | 0 | 1.056 | 0.099 | 0.803 |
| 407500 | 0 | 1.056 | 0.099 | 0.803 |
| 408000 | 0 | 1.055 | 0.099 | 0.803 |
| 408500 | 0 | 1.054 | 0.098 | 0.803 |
| 409000 | 0 | 1.052 | 0.098 | 0.804 |
| 409500 | 0 | 1.051 | 0.098 | 0.804 |
| 410000 | 0 | 1.049 | 0.098 | 0.805 |
| 410500 | 0 | 1.048 | 0.098 | 0.805 |
| 411000 | 0 | 1.048 | 0.098 | 0.805 |
| 411500 | 0 | 1.047 | 0.098 | 0.805 |
| 412000 | 0 | 1.046 | 0.098 | 0.805 |
| 412500 | 0 | 1.045 | 0.097 | 0.806 |
| 413000 | 0 | 1.045 | 0.097 | 0.806 |
| 413500 | 0 | 1.045 | 0.097 | 0.806 |
| 414000 | 0 | 1.044 | 0.097 | 0.806 |
| 414500 | 0 | 1.044 | 0.097 | 0.806 |
| 415000 | 0 | 1.044 | 0.097 | 0.806 |
| 415500 | 0 | 1.042 | 0.097 | 0.806 |
| 416000 | 0 | 1.041 | 0.097 | 0.807 |
| 416500 | 0 | 1.041 | 0.097 | 0.807 |
| 417000 | 0 | 1.038 | 0.096 | 0.808 |
| 417500 | 0 | 1.035 | 0.096 | 0.808 |
| 418000 | 0 | 1.034 | 0.096 | 0.809 |
| 418500 | 0 | 1.033 | 0.096 | 0.809 |
| 419000 | 0 | 1.031 | 0.095 | 0.809 |
| 419500 | 0 | 1.029 | 0.095 | 0.81 |
| 420000 | 0 | 1.027 | 0.095 | 0.81 |
| 420500 | 0 | 1.025 | 0.094 | 0.811 |
| 421000 | 0 | 1.023 | 0.094 | 0.811 |
| 421500 | 0 | 1.023 | 0.094 | 0.812 |
| 422000 | 0 | 1.02 | 0.094 | 0.812 |
| 422500 | 0 | 1.019 | 0.094 | 0.812 |
| 423000 | 0 | 1.017 | 0.093 | 0.813 |
| 423500 | 0 | 1.016 | 0.094 | 0.813 |
| 424000 | 0 | 1.014 | 0.093 | 0.814 |
| 424500 | 0 | 1.014 | 0.093 | 0.814 |
| 425000 | 0 | 1.012 | 0.093 | 0.814 |
| 425500 | 0 | 1.011 | 0.093 | 0.815 |
| 426000 | 0 | 1.009 | 0.092 | 0.815 |
| 426500 | 0 | 1.007 | 0.092 | 0.816 |
| 427000 | 0 | 1.007 | 0.092 | 0.816 |
| 427500 | 0 | 1.006 | 0.092 | 0.816 |
| 428000 | 0 | 1.005 | 0.092 | 0.816 |
| 428500 | 0 | 1.003 | 0.092 | 0.817 |
| 429000 | 0 | 1.002 | 0.092 | 0.817 |
| 429500 | 0 | 1.002 | 0.092 | 0.817 |
| 430000 | 0 | 1.002 | 0.091 | 0.817 |
| 430500 | 0 | 1.002 | 0.092 | 0.817 |
| 431000 | 0 | 1.001 | 0.091 | 0.817 |
| 431500 | 0 | 0.999 | 0.091 | 0.818 |
| 432000 | 0 | 0.997 | 0.091 | 0.818 |
| 432500 | 0 | 0.996 | 0.091 | 0.818 |
| 433000 | 0 | 0.995 | 0.09 | 0.819 |
| 433500 | 0 | 0.993 | 0.09 | 0.819 |
| 434000 | 0 | 0.992 | 0.09 | 0.819 |
| 434500 | 0 | 0.992 | 0.09 | 0.82 |
| 435000 | 0 | 0.989 | 0.09 | 0.82 |
| 435500 | 0 | 0.988 | 0.09 | 0.821 |
| 436000 | 0 | 0.987 | 0.09 | 0.821 |
| 436500 | 0 | 0.985 | 0.089 | 0.821 |
| 437000 | 0 | 0.984 | 0.089 | 0.822 |
| 437500 | 0 | 0.982 | 0.089 | 0.822 |
| 438000 | 0 | 0.982 | 0.089 | 0.822 |
| 438500 | 0 | 0.981 | 0.089 | 0.822 |
| 439000 | 0 | 0.98 | 0.089 | 0.823 |
| 439500 | 0 | 0.978 | 0.088 | 0.823 |
| 440000 | 0 | 0.976 | 0.088 | 0.824 |
| 440500 | 0 | 0.974 | 0.088 | 0.824 |
| 441000 | 0 | 0.972 | 0.088 | 0.825 |
| 441500 | 0 | 0.971 | 0.088 | 0.825 |
| 442000 | 0 | 0.971 | 0.087 | 0.825 |
| 442500 | 0 | 0.97 | 0.087 | 0.825 |
| 443000 | 0 | 0.968 | 0.087 | 0.826 |
| 443500 | 0 | 0.968 | 0.087 | 0.826 |
| 444000 | 0 | 0.966 | 0.087 | 0.826 |
| 444500 | 0 | 0.966 | 0.087 | 0.826 |
| 445000 | 0 | 0.965 | 0.087 | 0.826 |
| 445500 | 0 | 0.962 | 0.086 | 0.827 |
| 446000 | 0 | 0.961 | 0.086 | 0.827 |
| 446500 | 0 | 0.961 | 0.086 | 0.827 |
| 447000 | 0 | 0.961 | 0.086 | 0.827 |
| 447500 | 0 | 0.96 | 0.086 | 0.828 |
| 448000 | 0 | 0.959 | 0.086 | 0.828 |
| 448500 | 0 | 0.956 | 0.086 | 0.829 |
| 449000 | 0 | 0.955 | 0.086 | 0.829 |
| 449500 | 0 | 0.954 | 0.085 | 0.829 |
| 450000 | 0 | 0.953 | 0.085 | 0.829 |
| 450500 | 0 | 0.953 | 0.085 | 0.829 |
| 451000 | 0 | 0.952 | 0.085 | 0.83 |
| 451500 | 0 | 0.951 | 0.085 | 0.83 |
| 452000 | 0 | 0.95 | 0.085 | 0.83 |
| 452500 | 0 | 0.948 | 0.084 | 0.831 |
| 453000 | 0 | 0.946 | 0.084 | 0.831 |
| 453500 | 0 | 0.945 | 0.084 | 0.831 |
| 454000 | 0 | 0.944 | 0.084 | 0.832 |
| 454500 | 0 | 0.944 | 0.084 | 0.832 |
| 455000 | 0 | 0.943 | 0.084 | 0.832 |
| 455500 | 0 | 0.941 | 0.084 | 0.832 |
| 456000 | 0 | 0.939 | 0.084 | 0.833 |
| 456500 | 0 | 0.937 | 0.083 | 0.833 |
| 457000 | 0 | 0.935 | 0.083 | 0.834 |
| 457500 | 0 | 0.933 | 0.083 | 0.834 |
| 458000 | 0 | 0.932 | 0.083 | 0.835 |
| 458500 | 0 | 0.93 | 0.082 | 0.835 |
| 459000 | 0 | 0.928 | 0.082 | 0.836 |
| 459500 | 0 | 0.926 | 0.082 | 0.836 |
| 460000 | 0 | 0.924 | 0.082 | 0.836 |
| 460500 | 0 | 0.924 | 0.082 | 0.836 |
| 461000 | 0 | 0.922 | 0.082 | 0.837 |
| 461500 | 0 | 0.922 | 0.081 | 0.837 |
| 462000 | 0 | 0.922 | 0.082 | 0.837 |
| 462500 | 0 | 0.921 | 0.081 | 0.837 |
| 463000 | 0 | 0.921 | 0.082 | 0.837 |
| 463500 | 0 | 0.918 | 0.081 | 0.838 |
| 464000 | 0 | 0.916 | 0.081 | 0.838 |
| 464500 | 0 | 0.914 | 0.08 | 0.839 |
| 465000 | 0 | 0.912 | 0.08 | 0.84 |
| 465500 | 0 | 0.911 | 0.08 | 0.84 |
| 466000 | 0 | 0.911 | 0.08 | 0.84 |
| 466500 | 0 | 0.908 | 0.08 | 0.84 |
| 467000 | 0 | 0.905 | 0.079 | 0.841 |
| 467500 | 0 | 0.904 | 0.079 | 0.841 |
| 468000 | 0 | 0.904 | 0.079 | 0.841 |
| 468500 | 0 | 0.903 | 0.079 | 0.842 |
| 469000 | 0 | 0.901 | 0.079 | 0.842 |
| 469500 | 0 | 0.899 | 0.079 | 0.843 |
| 470000 | 0 | 0.898 | 0.078 | 0.843 |
| 470500 | 0 | 0.897 | 0.078 | 0.843 |
| 471000 | 0 | 0.897 | 0.078 | 0.843 |
| 471500 | 0 | 0.894 | 0.078 | 0.844 |
| 472000 | 0 | 0.892 | 0.078 | 0.844 |
| 472500 | 0 | 0.89 | 0.078 | 0.845 |
| 473000 | 0 | 0.889 | 0.078 | 0.845 |
| 473500 | 0 | 0.888 | 0.078 | 0.845 |
| 474000 | 0 | 0.888 | 0.077 | 0.845 |
| 474500 | 0 | 0.887 | 0.077 | 0.846 |
| 475000 | 0 | 0.883 | 0.077 | 0.846 |
| 475500 | 0 | 0.882 | 0.076 | 0.847 |
| 476000 | 0 | 0.881 | 0.076 | 0.847 |
| 476500 | 0 | 0.881 | 0.076 | 0.847 |
| 477000 | 0 | 0.88 | 0.076 | 0.847 |
| 477500 | 0 | 0.878 | 0.076 | 0.848 |
| 478000 | 0 | 0.876 | 0.076 | 0.848 |
| 478500 | 0 | 0.876 | 0.076 | 0.848 |
| 479000 | 0 | 0.873 | 0.076 | 0.849 |
| 479500 | 0 | 0.871 | 0.075 | 0.849 |
| 480000 | 0 | 0.87 | 0.075 | 0.85 |
| 480500 | 0 | 0.867 | 0.075 | 0.85 |
| 481000 | 0 | 0.866 | 0.075 | 0.851 |
| 481500 | 0 | 0.863 | 0.074 | 0.851 |
| 482000 | 0 | 0.862 | 0.074 | 0.852 |
| 482500 | 0 | 0.861 | 0.074 | 0.852 |
| 483000 | 0 | 0.86 | 0.074 | 0.852 |
| 483500 | 0 | 0.86 | 0.074 | 0.852 |
| 484000 | 0 | 0.858 | 0.074 | 0.852 |
| 484500 | 0 | 0.857 | 0.074 | 0.853 |
| 485000 | 0 | 0.856 | 0.074 | 0.853 |
| 485500 | 0 | 0.855 | 0.073 | 0.853 |
| 486000 | 0 | 0.851 | 0.073 | 0.854 |
| 486500 | 0 | 0.849 | 0.073 | 0.854 |
| 487000 | 0 | 0.849 | 0.072 | 0.855 |
| 487500 | 0 | 0.848 | 0.073 | 0.855 |
| 488000 | 0 | 0.848 | 0.073 | 0.855 |
| 488500 | 0 | 0.847 | 0.072 | 0.855 |
| 489000 | 0 | 0.847 | 0.072 | 0.855 |
| 489500 | 0 | 0.846 | 0.072 | 0.855 |
| 490000 | 0 | 0.843 | 0.072 | 0.856 |
| 490500 | 0 | 0.84 | 0.072 | 0.856 |
| 491000 | 0 | 0.838 | 0.072 | 0.857 |
| 491500 | 0 | 0.834 | 0.071 | 0.858 |
| 492000 | 0 | 0.832 | 0.071 | 0.859 |
| 492500 | 0 | 0.83 | 0.071 | 0.859 |
| 493000 | 0 | 0.83 | 0.07 | 0.859 |
| 493500 | 0 | 0.829 | 0.07 | 0.859 |
| 494000 | 0 | 0.828 | 0.07 | 0.859 |
| 494500 | 0 | 0.828 | 0.07 | 0.859 |
| 495000 | 0 | 0.828 | 0.07 | 0.859 |
| 495500 | 0 | 0.827 | 0.07 | 0.86 |
| 496000 | 0 | 0.825 | 0.07 | 0.86 |
| 496500 | 0 | 0.824 | 0.07 | 0.86 |
| 497000 | 0 | 0.822 | 0.07 | 0.861 |
| 497500 | 0 | 0.82 | 0.07 | 0.861 |
| 498000 | 0 | 0.818 | 0.069 | 0.862 |
| 498500 | 0 | 0.816 | 0.069 | 0.862 |
| 499000 | 0 | 0.814 | 0.069 | 0.862 |
| 499500 | 0 | 0.814 | 0.069 | 0.863 |
| 500000 | 0 | 0.811 | 0.068 | 0.863 |
| 500500 | 0 | 0.808 | 0.068 | 0.864 |
| 501000 | 0 | 0.807 | 0.068 | 0.864 |
| 501500 | 0 | 0.806 | 0.068 | 0.865 |
| 502000 | 0 | 0.804 | 0.068 | 0.865 |
| 502500 | 0 | 0.803 | 0.068 | 0.865 |
| 503000 | 0 | 0.8 | 0.067 | 0.866 |
| 503500 | 0 | 0.8 | 0.067 | 0.866 |
| 504000 | 0 | 0.798 | 0.067 | 0.866 |
| 504500 | 0 | 0.795 | 0.067 | 0.867 |
| 505000 | 0 | 0.794 | 0.066 | 0.867 |
| 505500 | 0 | 0.794 | 0.066 | 0.867 |
| 506000 | 0 | 0.792 | 0.066 | 0.867 |
| 506500 | 0 | 0.792 | 0.066 | 0.868 |
| 507000 | 0 | 0.79 | 0.066 | 0.868 |
| 507500 | 0 | 0.79 | 0.066 | 0.868 |
| 508000 | 0 | 0.789 | 0.066 | 0.868 |
| 508500 | 0 | 0.789 | 0.066 | 0.868 |
| 509000 | 0 | 0.788 | 0.066 | 0.868 |
| 509500 | 0 | 0.786 | 0.065 | 0.869 |
| 510000 | 0 | 0.784 | 0.066 | 0.869 |
| 510500 | 0 | 0.782 | 0.065 | 0.87 |
| 511000 | 0 | 0.78 | 0.065 | 0.87 |
| 511500 | 0 | 0.778 | 0.064 | 0.871 |
| 512000 | 0 | 0.777 | 0.064 | 0.871 |
| 512500 | 0 | 0.776 | 0.064 | 0.871 |
| 513000 | 0 | 0.774 | 0.064 | 0.872 |
| 513500 | 0 | 0.774 | 0.064 | 0.872 |
| 514000 | 0 | 0.773 | 0.064 | 0.872 |
| 514500 | 0 | 0.771 | 0.064 | 0.872 |
| 515000 | 0 | 0.771 | 0.064 | 0.872 |
| 515500 | 0 | 0.771 | 0.064 | 0.872 |
| 516000 | 0 | 0.77 | 0.064 | 0.872 |
| 516500 | 0 | 0.769 | 0.064 | 0.873 |
| 517000 | 0 | 0.768 | 0.063 | 0.873 |
| 517500 | 0 | 0.766 | 0.063 | 0.874 |
| 518000 | 0 | 0.764 | 0.063 | 0.874 |
| 518500 | 0 | 0.764 | 0.063 | 0.874 |
| 519000 | 0 | 0.763 | 0.063 | 0.874 |
| 519500 | 0 | 0.762 | 0.063 | 0.874 |
| 520000 | 0 | 0.76 | 0.063 | 0.875 |
| 520500 | 0 | 0.758 | 0.062 | 0.875 |
| 521000 | 0 | 0.757 | 0.062 | 0.875 |
| 521500 | 0 | 0.755 | 0.062 | 0.876 |
| 522000 | 0 | 0.754 | 0.062 | 0.876 |
| 522500 | 0 | 0.753 | 0.062 | 0.876 |
| 523000 | 0 | 0.752 | 0.062 | 0.877 |
| 523500 | 0 | 0.752 | 0.062 | 0.877 |
| 524000 | 0 | 0.751 | 0.062 | 0.877 |
| 524500 | 0 | 0.752 | 0.062 | 0.877 |
| 525000 | 0 | 0.752 | 0.062 | 0.877 |
| 525500 | 0 | 0.749 | 0.061 | 0.877 |
| 526000 | 0 | 0.748 | 0.062 | 0.877 |
| 526500 | 0 | 0.746 | 0.061 | 0.878 |
| 527000 | 0 | 0.745 | 0.061 | 0.878 |
| 527500 | 0 | 0.744 | 0.061 | 0.878 |
| 528000 | 0 | 0.743 | 0.061 | 0.878 |
| 528500 | 0 | 0.742 | 0.061 | 0.879 |
| 529000 | 0 | 0.742 | 0.06 | 0.879 |
| 529500 | 0 | 0.74 | 0.06 | 0.879 |
| 530000 | 0 | 0.737 | 0.06 | 0.88 |
| 530500 | 0 | 0.737 | 0.06 | 0.88 |
| 531000 | 0 | 0.737 | 0.06 | 0.88 |
| 531500 | 0 | 0.735 | 0.06 | 0.88 |
| 532000 | 0 | 0.734 | 0.06 | 0.88 |
| 532500 | 0 | 0.734 | 0.06 | 0.88 |
| 533000 | 0 | 0.733 | 0.06 | 0.881 |
| 533500 | 0 | 0.733 | 0.06 | 0.881 |
| 534000 | 0 | 0.732 | 0.06 | 0.881 |
| 534500 | 0 | 0.732 | 0.06 | 0.881 |
| 535000 | 0 | 0.73 | 0.059 | 0.881 |
| 535500 | 0 | 0.729 | 0.059 | 0.881 |
| 536000 | 0 | 0.728 | 0.059 | 0.882 |
| 536500 | 0 | 0.726 | 0.059 | 0.882 |
| 537000 | 0 | 0.723 | 0.058 | 0.883 |
| 537500 | 0 | 0.723 | 0.059 | 0.883 |
| 538000 | 0 | 0.723 | 0.059 | 0.883 |
| 538500 | 0 | 0.723 | 0.059 | 0.883 |
| 539000 | 0 | 0.72 | 0.058 | 0.883 |
| 539500 | 0 | 0.72 | 0.058 | 0.884 |
| 540000 | 0 | 0.719 | 0.058 | 0.884 |
| 540500 | 0 | 0.717 | 0.058 | 0.884 |
| 541000 | 0 | 0.716 | 0.058 | 0.884 |
| 541500 | 0 | 0.714 | 0.057 | 0.885 |
| 542000 | 0 | 0.713 | 0.058 | 0.885 |
| 542500 | 0 | 0.712 | 0.058 | 0.885 |
| 543000 | 0 | 0.711 | 0.057 | 0.885 |
| 543500 | 0 | 0.709 | 0.057 | 0.886 |
| 544000 | 0 | 0.708 | 0.057 | 0.886 |
| 544500 | 0 | 0.707 | 0.057 | 0.886 |
| 545000 | 0 | 0.706 | 0.057 | 0.887 |
| 545500 | 0 | 0.705 | 0.057 | 0.887 |
| 546000 | 0 | 0.704 | 0.057 | 0.887 |
| 546500 | 0 | 0.703 | 0.056 | 0.887 |
| 547000 | 0 | 0.702 | 0.056 | 0.887 |
| 547500 | 0 | 0.701 | 0.056 | 0.888 |
| 548000 | 0 | 0.701 | 0.056 | 0.888 |
| 548500 | 0 | 0.698 | 0.056 | 0.888 |
| 549000 | 0 | 0.696 | 0.056 | 0.889 |
| 549500 | 0 | 0.695 | 0.056 | 0.889 |
| 550000 | 0 | 0.694 | 0.055 | 0.889 |
| 550500 | 0 | 0.694 | 0.056 | 0.889 |
| 551000 | 0 | 0.694 | 0.056 | 0.889 |
| 551500 | 0 | 0.693 | 0.055 | 0.889 |
| 552000 | 0 | 0.693 | 0.055 | 0.889 |
| 552500 | 0 | 0.692 | 0.055 | 0.889 |
| 553000 | 0 | 0.692 | 0.055 | 0.889 |
| 553500 | 0 | 0.692 | 0.055 | 0.889 |
| 554000 | 0 | 0.691 | 0.055 | 0.89 |
| 554500 | 0 | 0.689 | 0.055 | 0.89 |
| 555000 | 0 | 0.687 | 0.055 | 0.89 |
| 555500 | 0 | 0.686 | 0.055 | 0.891 |
| 556000 | 0 | 0.684 | 0.055 | 0.891 |
| 556500 | 0 | 0.682 | 0.054 | 0.891 |
| 557000 | 0 | 0.68 | 0.054 | 0.892 |
| 557500 | 0 | 0.678 | 0.054 | 0.892 |
| 558000 | 0 | 0.677 | 0.054 | 0.893 |
| 558500 | 0 | 0.676 | 0.054 | 0.893 |
| 559000 | 0 | 0.676 | 0.054 | 0.893 |
| 559500 | 0 | 0.675 | 0.054 | 0.893 |
| 560000 | 0 | 0.673 | 0.053 | 0.893 |
| 560500 | 0 | 0.671 | 0.053 | 0.894 |
| 561000 | 0 | 0.67 | 0.053 | 0.894 |
| 561500 | 0 | 0.67 | 0.053 | 0.894 |
| 562000 | 0 | 0.668 | 0.053 | 0.895 |
| 562500 | 0 | 0.666 | 0.052 | 0.895 |
| 563000 | 0 | 0.666 | 0.053 | 0.895 |
| 563500 | 0 | 0.666 | 0.053 | 0.895 |
| 564000 | 0 | 0.665 | 0.052 | 0.895 |
| 564500 | 0 | 0.664 | 0.052 | 0.895 |
| 565000 | 0 | 0.663 | 0.052 | 0.896 |
| 565500 | 0 | 0.662 | 0.052 | 0.896 |
| 566000 | 0 | 0.662 | 0.052 | 0.896 |
| 566500 | 0 | 0.661 | 0.052 | 0.896 |
| 567000 | 0 | 0.66 | 0.052 | 0.896 |
| 567500 | 0 | 0.659 | 0.052 | 0.896 |
| 568000 | 0 | 0.659 | 0.052 | 0.896 |
| 568500 | 0 | 0.658 | 0.052 | 0.897 |
| 569000 | 0 | 0.656 | 0.051 | 0.897 |
| 569500 | 0 | 0.653 | 0.051 | 0.897 |
| 570000 | 0 | 0.653 | 0.051 | 0.898 |
| 570500 | 0 | 0.652 | 0.051 | 0.898 |
| 571000 | 0 | 0.651 | 0.051 | 0.898 |
| 571500 | 0 | 0.65 | 0.051 | 0.898 |
| 572000 | 0 | 0.648 | 0.05 | 0.899 |
| 572500 | 0 | 0.646 | 0.05 | 0.899 |
| 573000 | 0 | 0.646 | 0.051 | 0.899 |
| 573500 | 0 | 0.646 | 0.05 | 0.899 |
| 574000 | 0 | 0.643 | 0.05 | 0.9 |
| 574500 | 0 | 0.641 | 0.05 | 0.9 |
| 575000 | 0 | 0.64 | 0.05 | 0.9 |
| 575500 | 0 | 0.639 | 0.05 | 0.9 |
| 576000 | 0 | 0.639 | 0.05 | 0.9 |
| 576500 | 0 | 0.638 | 0.05 | 0.901 |
| 577000 | 0 | 0.637 | 0.05 | 0.901 |
| 577500 | 0 | 0.636 | 0.05 | 0.901 |
| 578000 | 0 | 0.636 | 0.05 | 0.901 |
| 578500 | 0 | 0.636 | 0.05 | 0.901 |
| 579000 | 0 | 0.636 | 0.05 | 0.901 |
| 579500 | 0 | 0.636 | 0.05 | 0.901 |
| 580000 | 0 | 0.635 | 0.05 | 0.901 |
| 580500 | 0 | 0.634 | 0.049 | 0.901 |
| 581000 | 0 | 0.634 | 0.049 | 0.901 |
| 581500 | 0 | 0.634 | 0.049 | 0.901 |
| 582000 | 0 | 0.634 | 0.049 | 0.902 |
| 582500 | 0 | 0.631 | 0.049 | 0.902 |
| 583000 | 0 | 0.63 | 0.049 | 0.902 |
| 583500 | 0 | 0.63 | 0.049 | 0.902 |
| 584000 | 0 | 0.629 | 0.049 | 0.902 |
| 584500 | 0 | 0.628 | 0.048 | 0.903 |
| 585000 | 0 | 0.627 | 0.049 | 0.903 |
| 585500 | 0 | 0.626 | 0.048 | 0.903 |
| 586000 | 0 | 0.626 | 0.048 | 0.903 |
| 586500 | 0 | 0.626 | 0.049 | 0.903 |
| 587000 | 0 | 0.626 | 0.048 | 0.903 |
| 587500 | 0 | 0.625 | 0.048 | 0.903 |
| 588000 | 0 | 0.625 | 0.048 | 0.903 |
| 588500 | 0 | 0.624 | 0.048 | 0.903 |
| 589000 | 0 | 0.623 | 0.048 | 0.904 |
| 589500 | 0 | 0.622 | 0.048 | 0.904 |
| 590000 | 0 | 0.621 | 0.048 | 0.904 |
| 590500 | 0 | 0.621 | 0.048 | 0.904 |
| 591000 | 0 | 0.619 | 0.048 | 0.904 |
| 591500 | 0 | 0.619 | 0.048 | 0.904 |
| 592000 | 0 | 0.618 | 0.048 | 0.905 |
| 592500 | 0 | 0.616 | 0.048 | 0.905 |
| 593000 | 0 | 0.614 | 0.047 | 0.905 |
| 593500 | 0 | 0.613 | 0.047 | 0.906 |
| 594000 | 0 | 0.613 | 0.047 | 0.906 |
| 594500 | 0 | 0.613 | 0.047 | 0.906 |
| 595000 | 0 | 0.612 | 0.047 | 0.906 |
| 595500 | 0 | 0.61 | 0.047 | 0.906 |
| 596000 | 0 | 0.607 | 0.046 | 0.907 |
| 596500 | 0 | 0.606 | 0.046 | 0.907 |
| 597000 | 0 | 0.604 | 0.046 | 0.907 |
| 597500 | 0 | 0.604 | 0.046 | 0.907 |
| 598000 | 0 | 0.605 | 0.046 | 0.907 |
| 598500 | 0 | 0.605 | 0.046 | 0.907 |
| 599000 | 0 | 0.604 | 0.046 | 0.907 |
| 599500 | 0 | 0.604 | 0.046 | 0.908 |
| 600000 | 0 | 0.602 | 0.046 | 0.908 |
| 600500 | 0 | 0.602 | 0.046 | 0.908 |
| 601000 | 0 | 0.602 | 0.046 | 0.908 |
| 601500 | 0 | 0.601 | 0.046 | 0.908 |
| 602000 | 0 | 0.597 | 0.046 | 0.909 |
| 602500 | 0 | 0.596 | 0.045 | 0.909 |
| 603000 | 0 | 0.593 | 0.045 | 0.91 |
| 603500 | 0 | 0.592 | 0.045 | 0.91 |
| 604000 | 0 | 0.59 | 0.045 | 0.91 |
| 604500 | 0 | 0.588 | 0.045 | 0.911 |
| 605000 | 0 | 0.588 | 0.044 | 0.911 |
| 605500 | 0 | 0.587 | 0.045 | 0.911 |
| 606000 | 0 | 0.587 | 0.044 | 0.911 |
| 606500 | 0 | 0.584 | 0.044 | 0.911 |
| 607000 | 0 | 0.583 | 0.044 | 0.912 |
| 607500 | 0 | 0.581 | 0.044 | 0.912 |
| 608000 | 0 | 0.581 | 0.044 | 0.912 |
| 608500 | 0 | 0.581 | 0.044 | 0.912 |
| 609000 | 0 | 0.58 | 0.044 | 0.912 |
| 609500 | 0 | 0.58 | 0.044 | 0.912 |
| 610000 | 0 | 0.58 | 0.044 | 0.912 |
| 610500 | 0 | 0.579 | 0.044 | 0.913 |
| 611000 | 0 | 0.577 | 0.044 | 0.913 |
| 611500 | 0 | 0.575 | 0.043 | 0.913 |
| 612000 | 0 | 0.573 | 0.043 | 0.914 |
| 612500 | 0 | 0.573 | 0.043 | 0.914 |
| 613000 | 0 | 0.572 | 0.043 | 0.914 |
| 613500 | 0 | 0.572 | 0.043 | 0.914 |
| 614000 | 0 | 0.57 | 0.043 | 0.914 |
| 614500 | 0 | 0.569 | 0.043 | 0.914 |
| 615000 | 0 | 0.568 | 0.043 | 0.915 |
| 615500 | 0 | 0.567 | 0.042 | 0.915 |
| 616000 | 0 | 0.566 | 0.042 | 0.915 |
| 616500 | 0 | 0.565 | 0.042 | 0.915 |
| 617000 | 0 | 0.564 | 0.042 | 0.915 |
| 617500 | 0 | 0.562 | 0.042 | 0.916 |
| 618000 | 0 | 0.562 | 0.042 | 0.916 |
| 618500 | 0 | 0.562 | 0.042 | 0.916 |
| 619000 | 0 | 0.562 | 0.042 | 0.916 |
| 619500 | 0 | 0.561 | 0.042 | 0.916 |
| 620000 | 0 | 0.561 | 0.042 | 0.916 |
| 620500 | 0 | 0.56 | 0.042 | 0.916 |
| 621000 | 0 | 0.56 | 0.042 | 0.916 |
| 621500 | 0 | 0.56 | 0.042 | 0.916 |
| 622000 | 0 | 0.559 | 0.042 | 0.916 |
| 622500 | 0 | 0.557 | 0.042 | 0.917 |
| 623000 | 0 | 0.557 | 0.042 | 0.917 |
| 623500 | 0 | 0.556 | 0.042 | 0.917 |
| 624000 | 0 | 0.555 | 0.042 | 0.917 |
| 624500 | 0 | 0.554 | 0.041 | 0.917 |
| 625000 | 0 | 0.554 | 0.042 | 0.917 |
| 625500 | 0 | 0.554 | 0.042 | 0.917 |
| 626000 | 0 | 0.554 | 0.041 | 0.917 |
| 626500 | 0 | 0.554 | 0.041 | 0.917 |
| 627000 | 0 | 0.553 | 0.042 | 0.917 |
| 627500 | 0 | 0.551 | 0.041 | 0.918 |
| 628000 | 0 | 0.549 | 0.041 | 0.918 |
| 628500 | 0 | 0.549 | 0.041 | 0.918 |
| 629000 | 0 | 0.549 | 0.041 | 0.918 |
| 629500 | 0 | 0.548 | 0.041 | 0.918 |
| 630000 | 0 | 0.545 | 0.04 | 0.919 |
| 630500 | 0 | 0.545 | 0.04 | 0.919 |
| 631000 | 0 | 0.544 | 0.04 | 0.919 |
| 631500 | 0 | 0.543 | 0.04 | 0.919 |
| 632000 | 0 | 0.542 | 0.04 | 0.92 |
| 632500 | 0 | 0.541 | 0.04 | 0.92 |
| 633000 | 0 | 0.541 | 0.04 | 0.92 |
| 633500 | 0 | 0.54 | 0.04 | 0.92 |
| 634000 | 0 | 0.54 | 0.04 | 0.92 |
| 634500 | 0 | 0.54 | 0.04 | 0.92 |
| 635000 | 0 | 0.54 | 0.04 | 0.92 |
| 635500 | 0 | 0.54 | 0.04 | 0.92 |
| 636000 | 0 | 0.54 | 0.04 | 0.92 |
| 636500 | 0 | 0.54 | 0.04 | 0.92 |
| 637000 | 0 | 0.539 | 0.04 | 0.92 |
| 637500 | 0 | 0.539 | 0.04 | 0.92 |
| 638000 | 0 | 0.537 | 0.04 | 0.921 |
| 638500 | 0 | 0.536 | 0.04 | 0.921 |
| 639000 | 0 | 0.536 | 0.039 | 0.921 |
| 639500 | 0 | 0.535 | 0.04 | 0.921 |
| 640000 | 0 | 0.535 | 0.04 | 0.921 |
| 640500 | 0 | 0.535 | 0.04 | 0.921 |
| 641000 | 0 | 0.535 | 0.04 | 0.921 |
| 641500 | 0 | 0.534 | 0.04 | 0.921 |
| 642000 | 0 | 0.534 | 0.039 | 0.921 |
| 642500 | 0 | 0.531 | 0.039 | 0.922 |
| 643000 | 0 | 0.529 | 0.039 | 0.922 |
| 643500 | 0 | 0.528 | 0.039 | 0.922 |
| 644000 | 0 | 0.528 | 0.039 | 0.922 |
| 644500 | 0 | 0.526 | 0.039 | 0.923 |
| 645000 | 0 | 0.525 | 0.039 | 0.923 |
| 645500 | 0 | 0.523 | 0.038 | 0.923 |
| 646000 | 0 | 0.522 | 0.038 | 0.923 |
| 646500 | 0 | 0.521 | 0.038 | 0.924 |
| 647000 | 0 | 0.52 | 0.038 | 0.924 |
| 647500 | 0 | 0.518 | 0.038 | 0.924 |
| 648000 | 0 | 0.517 | 0.038 | 0.924 |
| 648500 | 0 | 0.515 | 0.038 | 0.925 |
| 649000 | 0 | 0.515 | 0.038 | 0.925 |
| 649500 | 0 | 0.514 | 0.038 | 0.925 |
| 650000 | 0 | 0.511 | 0.037 | 0.925 |
| 650500 | 0 | 0.51 | 0.037 | 0.926 |
| 651000 | 0 | 0.508 | 0.037 | 0.926 |
| 651500 | 0 | 0.507 | 0.037 | 0.926 |
| 652000 | 0 | 0.507 | 0.037 | 0.926 |
| 652500 | 0 | 0.506 | 0.037 | 0.926 |
| 653000 | 0 | 0.505 | 0.037 | 0.927 |
| 653500 | 0 | 0.505 | 0.037 | 0.927 |
| 654000 | 0 | 0.505 | 0.037 | 0.927 |
| 654500 | 0 | 0.504 | 0.037 | 0.927 |
| 655000 | 0 | 0.504 | 0.037 | 0.927 |
| 655500 | 0 | 0.503 | 0.036 | 0.927 |
| 656000 | 0 | 0.502 | 0.036 | 0.927 |
| 656500 | 0 | 0.5 | 0.036 | 0.927 |
| 657000 | 0 | 0.501 | 0.036 | 0.927 |
| 657500 | 0 | 0.5 | 0.036 | 0.928 |
| 658000 | 0 | 0.498 | 0.036 | 0.928 |
| 658500 | 0 | 0.498 | 0.036 | 0.928 |
| 659000 | 0 | 0.497 | 0.036 | 0.928 |
| 659500 | 0 | 0.496 | 0.036 | 0.928 |
| 660000 | 0 | 0.495 | 0.036 | 0.928 |
| 660500 | 0 | 0.495 | 0.036 | 0.928 |
| 661000 | 0 | 0.495 | 0.036 | 0.928 |
| 661500 | 0 | 0.494 | 0.036 | 0.929 |
| 662000 | 0 | 0.493 | 0.036 | 0.929 |
| 662500 | 0 | 0.491 | 0.035 | 0.929 |
| 663000 | 0 | 0.489 | 0.035 | 0.93 |
| 663500 | 0 | 0.489 | 0.035 | 0.93 |
| 664000 | 0 | 0.489 | 0.035 | 0.93 |
| 664500 | 0 | 0.489 | 0.035 | 0.93 |
| 665000 | 0 | 0.489 | 0.035 | 0.93 |
| 665500 | 0 | 0.489 | 0.035 | 0.93 |
| 666000 | 0 | 0.489 | 0.035 | 0.93 |
| 666500 | 0 | 0.489 | 0.035 | 0.93 |
| 667000 | 0 | 0.489 | 0.035 | 0.93 |
| 667500 | 0 | 0.489 | 0.035 | 0.93 |
| 668000 | 0 | 0.489 | 0.035 | 0.93 |
| 668500 | 0 | 0.488 | 0.035 | 0.93 |
| 669000 | 0 | 0.488 | 0.035 | 0.93 |
| 669500 | 0 | 0.487 | 0.035 | 0.93 |
| 670000 | 0 | 0.487 | 0.035 | 0.93 |
| 670500 | 0 | 0.486 | 0.035 | 0.93 |
| 671000 | 0 | 0.486 | 0.035 | 0.93 |
| 671500 | 0 | 0.485 | 0.035 | 0.93 |
| 672000 | 0 | 0.483 | 0.035 | 0.931 |
| 672500 | 0 | 0.483 | 0.035 | 0.931 |
| 673000 | 0 | 0.482 | 0.035 | 0.931 |
| 673500 | 0 | 0.479 | 0.034 | 0.931 |
| 674000 | 0 | 0.478 | 0.034 | 0.932 |
| 674500 | 0 | 0.476 | 0.034 | 0.932 |
| 675000 | 0 | 0.474 | 0.034 | 0.932 |
| 675500 | 0 | 0.474 | 0.034 | 0.932 |
| 676000 | 0 | 0.474 | 0.034 | 0.932 |
| 676500 | 0 | 0.473 | 0.034 | 0.932 |
| 677000 | 0 | 0.472 | 0.034 | 0.933 |
| 677500 | 0 | 0.471 | 0.034 | 0.933 |
| 678000 | 0 | 0.471 | 0.034 | 0.933 |
| 678500 | 0 | 0.471 | 0.034 | 0.933 |
| 679000 | 0 | 0.471 | 0.034 | 0.933 |
| 679500 | 0 | 0.471 | 0.034 | 0.933 |
| 680000 | 0 | 0.471 | 0.034 | 0.933 |
| 680500 | 0 | 0.471 | 0.034 | 0.933 |
| 681000 | 0 | 0.471 | 0.034 | 0.933 |
| 681500 | 0 | 0.471 | 0.034 | 0.933 |
| 682000 | 0 | 0.469 | 0.033 | 0.933 |
| 682500 | 0 | 0.468 | 0.033 | 0.933 |
| 683000 | 0 | 0.466 | 0.033 | 0.934 |
| 683500 | 0 | 0.465 | 0.033 | 0.934 |
| 684000 | 0 | 0.464 | 0.033 | 0.934 |
| 684500 | 0 | 0.463 | 0.033 | 0.934 |
| 685000 | 0 | 0.463 | 0.033 | 0.934 |
| 685500 | 0 | 0.463 | 0.033 | 0.934 |
| 686000 | 0 | 0.463 | 0.033 | 0.934 |
| 686500 | 0 | 0.463 | 0.033 | 0.934 |
| 687000 | 0 | 0.462 | 0.033 | 0.934 |
| 687500 | 0 | 0.461 | 0.033 | 0.935 |
| 688000 | 0 | 0.461 | 0.033 | 0.935 |
| 688500 | 0 | 0.46 | 0.033 | 0.935 |
| 689000 | 0 | 0.459 | 0.033 | 0.935 |
| 689500 | 0 | 0.458 | 0.032 | 0.935 |
| 690000 | 0 | 0.457 | 0.032 | 0.935 |
| 690500 | 0 | 0.457 | 0.032 | 0.935 |
| 691000 | 0 | 0.457 | 0.032 | 0.935 |
| 691500 | 0 | 0.457 | 0.032 | 0.935 |
| 692000 | 0 | 0.457 | 0.032 | 0.935 |
| 692500 | 0 | 0.456 | 0.032 | 0.936 |
| 693000 | 0 | 0.456 | 0.032 | 0.936 |
| 693500 | 0 | 0.455 | 0.032 | 0.936 |
| 694000 | 0 | 0.454 | 0.032 | 0.936 |
| 694500 | 0 | 0.454 | 0.032 | 0.936 |
| 695000 | 0 | 0.451 | 0.032 | 0.936 |
| 695500 | 0 | 0.451 | 0.032 | 0.936 |
| 696000 | 0 | 0.451 | 0.032 | 0.936 |
| 696500 | 0 | 0.45 | 0.032 | 0.937 |
| 697000 | 0 | 0.45 | 0.032 | 0.937 |
| 697500 | 0 | 0.45 | 0.032 | 0.937 |
| 698000 | 0 | 0.449 | 0.032 | 0.937 |
| 698500 | 0 | 0.449 | 0.032 | 0.937 |
| 699000 | 0 | 0.447 | 0.031 | 0.937 |
| 699500 | 0 | 0.447 | 0.032 | 0.937 |
| 700000 | 0 | 0.447 | 0.032 | 0.937 |
| 700500 | 0 | 0.447 | 0.031 | 0.937 |
| 701000 | 0 | 0.446 | 0.031 | 0.937 |
| 701500 | 0 | 0.446 | 0.031 | 0.937 |
| 702000 | 0 | 0.445 | 0.031 | 0.937 |
| 702500 | 0 | 0.446 | 0.031 | 0.937 |
| 703000 | 0 | 0.444 | 0.031 | 0.938 |
| 703500 | 0 | 0.444 | 0.031 | 0.938 |
| 704000 | 0 | 0.443 | 0.031 | 0.938 |
| 704500 | 0 | 0.443 | 0.031 | 0.938 |
| 705000 | 0 | 0.442 | 0.031 | 0.938 |
| 705500 | 0 | 0.442 | 0.031 | 0.938 |
| 706000 | 0 | 0.442 | 0.031 | 0.938 |
| 706500 | 0 | 0.44 | 0.031 | 0.938 |
| 707000 | 0 | 0.44 | 0.031 | 0.938 |
| 707500 | 0 | 0.44 | 0.031 | 0.938 |
| 708000 | 0 | 0.439 | 0.031 | 0.938 |
| 708500 | 0 | 0.438 | 0.031 | 0.939 |
| 709000 | 0 | 0.438 | 0.03 | 0.939 |
| 709500 | 0 | 0.438 | 0.031 | 0.939 |
| 710000 | 0 | 0.436 | 0.03 | 0.939 |
| 710500 | 0 | 0.434 | 0.03 | 0.939 |
| 711000 | 0 | 0.433 | 0.03 | 0.94 |
| 711500 | 0 | 0.433 | 0.03 | 0.94 |
| 712000 | 0 | 0.433 | 0.03 | 0.94 |
| 712500 | 0 | 0.432 | 0.03 | 0.94 |
| 713000 | 0 | 0.432 | 0.03 | 0.94 |
| 713500 | 0 | 0.432 | 0.03 | 0.94 |
| 714000 | 0 | 0.432 | 0.03 | 0.94 |
| 714500 | 0 | 0.432 | 0.03 | 0.94 |
| 715000 | 0 | 0.43 | 0.03 | 0.94 |
| 715500 | 0 | 0.429 | 0.03 | 0.94 |
| 716000 | 0 | 0.428 | 0.03 | 0.94 |
| 716500 | 0 | 0.427 | 0.03 | 0.941 |
| 717000 | 0 | 0.428 | 0.03 | 0.941 |
| 717500 | 0 | 0.427 | 0.03 | 0.941 |
| 718000 | 0 | 0.426 | 0.03 | 0.941 |
| 718500 | 0 | 0.426 | 0.03 | 0.941 |
| 719000 | 0 | 0.426 | 0.03 | 0.941 |
| 719500 | 0 | 0.425 | 0.03 | 0.941 |
| 720000 | 0 | 0.424 | 0.029 | 0.941 |
| 720500 | 0 | 0.423 | 0.029 | 0.941 |
| 721000 | 0 | 0.423 | 0.029 | 0.941 |
| 721500 | 0 | 0.423 | 0.029 | 0.941 |
| 722000 | 0 | 0.423 | 0.029 | 0.941 |
| 722500 | 0 | 0.423 | 0.029 | 0.941 |
| 723000 | 0 | 0.423 | 0.029 | 0.941 |
| 723500 | 0 | 0.423 | 0.029 | 0.941 |
| 724000 | 0 | 0.423 | 0.029 | 0.941 |
| 724500 | 0 | 0.423 | 0.029 | 0.941 |
| 725000 | 0 | 0.423 | 0.029 | 0.941 |
| 725500 | 0 | 0.422 | 0.029 | 0.942 |
| 726000 | 0 | 0.422 | 0.029 | 0.942 |
| 726500 | 0 | 0.422 | 0.029 | 0.942 |
| 727000 | 0 | 0.421 | 0.029 | 0.942 |
| 727500 | 0 | 0.42 | 0.029 | 0.942 |
| 728000 | 0 | 0.42 | 0.029 | 0.942 |
| 728500 | 0 | 0.42 | 0.029 | 0.942 |
| 729000 | 0 | 0.42 | 0.029 | 0.942 |
| 729500 | 0 | 0.42 | 0.029 | 0.942 |
| 730000 | 0 | 0.42 | 0.029 | 0.942 |
| 730500 | 0 | 0.418 | 0.029 | 0.942 |
| 731000 | 0 | 0.418 | 0.029 | 0.942 |
| 731500 | 0 | 0.417 | 0.029 | 0.942 |
| 732000 | 0 | 0.416 | 0.029 | 0.943 |
| 732500 | 0 | 0.416 | 0.029 | 0.943 |
| 733000 | 0 | 0.414 | 0.028 | 0.943 |
| 733500 | 0 | 0.414 | 0.028 | 0.943 |
| 734000 | 0 | 0.414 | 0.029 | 0.943 |
| 734500 | 0 | 0.414 | 0.028 | 0.943 |
| 735000 | 0 | 0.413 | 0.028 | 0.943 |
| 735500 | 0 | 0.412 | 0.028 | 0.943 |
| 736000 | 0 | 0.411 | 0.028 | 0.943 |
| 736500 | 0 | 0.411 | 0.028 | 0.943 |
| 737000 | 0 | 0.411 | 0.028 | 0.943 |
| 737500 | 0 | 0.411 | 0.028 | 0.943 |
| 738000 | 0 | 0.411 | 0.028 | 0.943 |
| 738500 | 0 | 0.411 | 0.028 | 0.943 |
| 739000 | 0 | 0.411 | 0.028 | 0.943 |
| 739500 | 0 | 0.41 | 0.028 | 0.944 |
| 740000 | 0 | 0.41 | 0.028 | 0.944 |
| 740500 | 0 | 0.41 | 0.028 | 0.944 |
| 741000 | 0 | 0.408 | 0.028 | 0.944 |
| 741500 | 0 | 0.408 | 0.028 | 0.944 |
| 742000 | 0 | 0.407 | 0.028 | 0.944 |
| 742500 | 0 | 0.406 | 0.028 | 0.944 |
| 743000 | 0 | 0.405 | 0.028 | 0.944 |
| 743500 | 0 | 0.403 | 0.028 | 0.945 |
| 744000 | 0 | 0.403 | 0.028 | 0.945 |
| 744500 | 0 | 0.403 | 0.028 | 0.945 |
| 745000 | 0 | 0.402 | 0.028 | 0.945 |
| 745500 | 0 | 0.402 | 0.028 | 0.945 |
| 746000 | 0 | 0.401 | 0.027 | 0.945 |
| 746500 | 0 | 0.4 | 0.027 | 0.945 |
| 747000 | 0 | 0.4 | 0.027 | 0.945 |
| 747500 | 0 | 0.4 | 0.027 | 0.945 |
| 748000 | 0 | 0.399 | 0.027 | 0.946 |
| 748500 | 0 | 0.399 | 0.027 | 0.946 |
| 749000 | 0 | 0.397 | 0.027 | 0.946 |
| 749500 | 0 | 0.394 | 0.027 | 0.946 |
| 750000 | 0 | 0.393 | 0.027 | 0.947 |
| 750500 | 0 | 0.392 | 0.026 | 0.947 |
| 751000 | 0 | 0.39 | 0.026 | 0.947 |
| 751500 | 0 | 0.388 | 0.026 | 0.947 |
| 752000 | 0 | 0.387 | 0.026 | 0.948 |
| 752500 | 0 | 0.386 | 0.026 | 0.948 |
| 753000 | 0 | 0.384 | 0.026 | 0.948 |
| 753500 | 0 | 0.382 | 0.026 | 0.948 |
| 754000 | 0 | 0.38 | 0.026 | 0.949 |
| 754500 | 0 | 0.379 | 0.026 | 0.949 |
| 755000 | 0 | 0.378 | 0.025 | 0.949 |
| 755500 | 0 | 0.377 | 0.025 | 0.949 |
| 756000 | 0 | 0.376 | 0.025 | 0.949 |
| 756500 | 0 | 0.376 | 0.025 | 0.949 |
| 757000 | 0 | 0.376 | 0.025 | 0.949 |
| 757500 | 0 | 0.375 | 0.025 | 0.95 |
| 758000 | 0 | 0.375 | 0.025 | 0.95 |
| 758500 | 0 | 0.375 | 0.025 | 0.95 |
| 759000 | 0 | 0.374 | 0.025 | 0.95 |
| 759500 | 0 | 0.374 | 0.025 | 0.95 |
| 760000 | 0 | 0.374 | 0.025 | 0.95 |
| 760500 | 0 | 0.373 | 0.025 | 0.95 |
| 761000 | 0 | 0.371 | 0.025 | 0.95 |
| 761500 | 0 | 0.371 | 0.025 | 0.95 |
| 762000 | 0 | 0.371 | 0.025 | 0.95 |
| 762500 | 0 | 0.371 | 0.025 | 0.95 |
| 763000 | 0 | 0.369 | 0.025 | 0.951 |
| 763500 | 0 | 0.369 | 0.025 | 0.951 |
| 764000 | 0 | 0.368 | 0.024 | 0.951 |
| 764500 | 0 | 0.368 | 0.025 | 0.951 |
| 765000 | 0 | 0.368 | 0.025 | 0.951 |
| 765500 | 0 | 0.368 | 0.025 | 0.951 |
| 766000 | 0 | 0.367 | 0.024 | 0.951 |
| 766500 | 0 | 0.366 | 0.024 | 0.951 |
| 767000 | 0 | 0.365 | 0.024 | 0.951 |
| 767500 | 0 | 0.365 | 0.024 | 0.951 |
| 768000 | 0 | 0.365 | 0.024 | 0.951 |
| 768500 | 0 | 0.365 | 0.024 | 0.951 |
| 769000 | 0 | 0.364 | 0.024 | 0.951 |
| 769500 | 0 | 0.362 | 0.024 | 0.952 |
| 770000 | 0 | 0.362 | 0.024 | 0.952 |
| 770500 | 0 | 0.362 | 0.024 | 0.952 |
| 771000 | 0 | 0.361 | 0.024 | 0.952 |
| 771500 | 0 | 0.36 | 0.024 | 0.952 |
| 772000 | 0 | 0.36 | 0.024 | 0.952 |
| 772500 | 0 | 0.358 | 0.024 | 0.952 |
| 773000 | 0 | 0.358 | 0.024 | 0.952 |
| 773500 | 0 | 0.358 | 0.024 | 0.952 |
| 774000 | 0 | 0.357 | 0.024 | 0.953 |
| 774500 | 0 | 0.355 | 0.024 | 0.953 |
| 775000 | 0 | 0.354 | 0.024 | 0.953 |
| 775500 | 0 | 0.354 | 0.024 | 0.953 |
| 776000 | 0 | 0.353 | 0.024 | 0.953 |
| 776500 | 0 | 0.353 | 0.023 | 0.953 |
| 777000 | 0 | 0.353 | 0.023 | 0.953 |
| 777500 | 0 | 0.353 | 0.023 | 0.953 |
| 778000 | 0 | 0.353 | 0.023 | 0.953 |
| 778500 | 0 | 0.353 | 0.023 | 0.953 |
| 779000 | 0 | 0.352 | 0.023 | 0.953 |
| 779500 | 0 | 0.351 | 0.023 | 0.954 |
| 780000 | 0 | 0.35 | 0.023 | 0.954 |
| 780500 | 0 | 0.35 | 0.023 | 0.954 |
| 781000 | 0 | 0.35 | 0.023 | 0.954 |
| 781500 | 0 | 0.349 | 0.023 | 0.954 |
| 782000 | 0 | 0.348 | 0.023 | 0.954 |
| 782500 | 0 | 0.348 | 0.023 | 0.954 |
| 783000 | 0 | 0.345 | 0.023 | 0.955 |
| 783500 | 0 | 0.344 | 0.023 | 0.955 |
| 784000 | 0 | 0.344 | 0.023 | 0.955 |
| 784500 | 0 | 0.343 | 0.022 | 0.955 |
| 785000 | 0 | 0.343 | 0.023 | 0.955 |
| 785500 | 0 | 0.341 | 0.022 | 0.955 |
| 786000 | 0 | 0.341 | 0.022 | 0.955 |
| 786500 | 0 | 0.34 | 0.022 | 0.955 |
| 787000 | 0 | 0.339 | 0.022 | 0.956 |
| 787500 | 0 | 0.338 | 0.022 | 0.956 |
| 788000 | 0 | 0.337 | 0.022 | 0.956 |
| 788500 | 0 | 0.337 | 0.022 | 0.956 |
| 789000 | 0 | 0.337 | 0.022 | 0.956 |
| 789500 | 0 | 0.337 | 0.022 | 0.956 |
| 790000 | 0 | 0.337 | 0.022 | 0.956 |
| 790500 | 0 | 0.337 | 0.022 | 0.956 |
| 791000 | 0 | 0.337 | 0.022 | 0.956 |
| 791500 | 0 | 0.337 | 0.022 | 0.956 |
| 792000 | 0 | 0.336 | 0.022 | 0.956 |
| 792500 | 0 | 0.336 | 0.022 | 0.956 |
| 793000 | 0 | 0.334 | 0.022 | 0.956 |
| 793500 | 0 | 0.332 | 0.022 | 0.957 |
| 794000 | 0 | 0.332 | 0.022 | 0.957 |
| 794500 | 0 | 0.332 | 0.022 | 0.957 |
| 795000 | 0 | 0.331 | 0.021 | 0.957 |
| 795500 | 0 | 0.33 | 0.022 | 0.957 |
| 796000 | 0 | 0.329 | 0.022 | 0.957 |
| 796500 | 0 | 0.328 | 0.021 | 0.957 |
| 797000 | 0 | 0.327 | 0.021 | 0.957 |
| 797500 | 0 | 0.326 | 0.021 | 0.958 |
| 798000 | 0 | 0.326 | 0.021 | 0.958 |
| 798500 | 0 | 0.326 | 0.021 | 0.958 |
| 799000 | 0 | 0.325 | 0.021 | 0.958 |
| 799500 | 0 | 0.325 | 0.021 | 0.958 |
| 800000 | 0 | 0.325 | 0.021 | 0.958 |
| 800500 | 0 | 0.325 | 0.021 | 0.958 |
| 801000 | 0 | 0.323 | 0.021 | 0.958 |
| 801500 | 0 | 0.322 | 0.021 | 0.958 |
| 802000 | 0 | 0.323 | 0.021 | 0.958 |
| 802500 | 0 | 0.322 | 0.021 | 0.958 |
| 803000 | 0 | 0.322 | 0.021 | 0.958 |
| 803500 | 0 | 0.321 | 0.021 | 0.958 |
| 804000 | 0 | 0.321 | 0.021 | 0.958 |
| 804500 | 0 | 0.32 | 0.021 | 0.959 |
| 805000 | 0 | 0.32 | 0.021 | 0.959 |
| 805500 | 0 | 0.319 | 0.021 | 0.959 |
| 806000 | 0 | 0.319 | 0.021 | 0.959 |
| 806500 | 0 | 0.319 | 0.021 | 0.959 |
| 807000 | 0 | 0.317 | 0.02 | 0.959 |
| 807500 | 0 | 0.316 | 0.02 | 0.959 |
| 808000 | 0 | 0.316 | 0.02 | 0.959 |
| 808500 | 0 | 0.316 | 0.02 | 0.959 |
| 809000 | 0 | 0.316 | 0.02 | 0.959 |
| 809500 | 0 | 0.316 | 0.02 | 0.959 |
| 810000 | 0 | 0.314 | 0.02 | 0.96 |
| 810500 | 0 | 0.314 | 0.02 | 0.96 |
| 811000 | 0 | 0.314 | 0.02 | 0.96 |
| 811500 | 0 | 0.314 | 0.02 | 0.96 |
| 812000 | 0 | 0.314 | 0.02 | 0.96 |
| 812500 | 0 | 0.313 | 0.02 | 0.96 |
| 813000 | 0 | 0.312 | 0.02 | 0.96 |
| 813500 | 0 | 0.312 | 0.02 | 0.96 |
| 814000 | 0 | 0.312 | 0.02 | 0.96 |
| 814500 | 0 | 0.311 | 0.02 | 0.96 |
| 815000 | 0 | 0.31 | 0.02 | 0.96 |
| 815500 | 0 | 0.309 | 0.02 | 0.96 |
| 816000 | 0 | 0.309 | 0.02 | 0.96 |
| 816500 | 0 | 0.309 | 0.02 | 0.96 |
| 817000 | 0 | 0.309 | 0.02 | 0.96 |
| 817500 | 0 | 0.309 | 0.02 | 0.96 |
| 818000 | 0 | 0.309 | 0.02 | 0.96 |
| 818500 | 0 | 0.308 | 0.02 | 0.96 |
| 819000 | 0 | 0.309 | 0.02 | 0.96 |
| 819500 | 0 | 0.309 | 0.02 | 0.96 |
| 820000 | 0 | 0.309 | 0.02 | 0.96 |
| 820500 | 0 | 0.309 | 0.02 | 0.96 |
| 821000 | 0 | 0.308 | 0.02 | 0.96 |
| 821500 | 0 | 0.305 | 0.02 | 0.961 |
| 822000 | 0 | 0.304 | 0.02 | 0.961 |
| 822500 | 0 | 0.303 | 0.019 | 0.961 |
| 823000 | 0 | 0.304 | 0.019 | 0.961 |
| 823500 | 0 | 0.304 | 0.019 | 0.961 |
| 824000 | 0 | 0.304 | 0.019 | 0.961 |
| 824500 | 0 | 0.303 | 0.019 | 0.961 |
| 825000 | 0 | 0.302 | 0.019 | 0.961 |
| 825500 | 0 | 0.301 | 0.019 | 0.962 |
| 826000 | 0 | 0.301 | 0.019 | 0.962 |
| 826500 | 0 | 0.301 | 0.019 | 0.962 |
| 827000 | 0 | 0.301 | 0.019 | 0.962 |
| 827500 | 0 | 0.301 | 0.019 | 0.962 |
| 828000 | 0 | 0.301 | 0.019 | 0.962 |
| 828500 | 0 | 0.3 | 0.019 | 0.962 |
| 829000 | 0 | 0.3 | 0.019 | 0.962 |
| 829500 | 0 | 0.3 | 0.019 | 0.962 |
| 830000 | 0 | 0.3 | 0.019 | 0.962 |
| 830500 | 0 | 0.3 | 0.019 | 0.962 |
| 831000 | 0 | 0.3 | 0.019 | 0.962 |
| 831500 | 0 | 0.3 | 0.019 | 0.962 |
| 832000 | 0 | 0.3 | 0.019 | 0.962 |
| 832500 | 0 | 0.298 | 0.019 | 0.962 |
| 833000 | 0 | 0.297 | 0.019 | 0.962 |
| 833500 | 0 | 0.297 | 0.019 | 0.962 |
| 834000 | 0 | 0.297 | 0.019 | 0.962 |
| 834500 | 0 | 0.296 | 0.019 | 0.962 |
| 835000 | 0 | 0.296 | 0.019 | 0.962 |
| 835500 | 0 | 0.296 | 0.019 | 0.962 |
| 836000 | 0 | 0.296 | 0.019 | 0.962 |
| 836500 | 0 | 0.295 | 0.019 | 0.963 |
| 837000 | 0 | 0.293 | 0.019 | 0.963 |
| 837500 | 0 | 0.291 | 0.018 | 0.963 |
| 838000 | 0 | 0.291 | 0.018 | 0.963 |
| 838500 | 0 | 0.291 | 0.018 | 0.963 |
| 839000 | 0 | 0.291 | 0.018 | 0.963 |
| 839500 | 0 | 0.291 | 0.018 | 0.963 |
| 840000 | 0 | 0.291 | 0.018 | 0.963 |
| 840500 | 0 | 0.291 | 0.018 | 0.963 |
| 841000 | 0 | 0.291 | 0.018 | 0.963 |
| 841500 | 0 | 0.291 | 0.018 | 0.963 |
| 842000 | 0 | 0.291 | 0.018 | 0.963 |
| 842500 | 0 | 0.291 | 0.018 | 0.963 |
| 843000 | 0 | 0.29 | 0.018 | 0.963 |
| 843500 | 0 | 0.29 | 0.018 | 0.963 |
| 844000 | 0 | 0.289 | 0.018 | 0.963 |
| 844500 | 0 | 0.29 | 0.018 | 0.963 |
| 845000 | 0 | 0.29 | 0.018 | 0.963 |
| 845500 | 0 | 0.289 | 0.018 | 0.963 |
| 846000 | 0 | 0.288 | 0.018 | 0.964 |
| 846500 | 0 | 0.288 | 0.018 | 0.964 |
| 847000 | 0 | 0.286 | 0.018 | 0.964 |
| 847500 | 0 | 0.286 | 0.018 | 0.964 |
| 848000 | 0 | 0.284 | 0.018 | 0.964 |
| 848500 | 0 | 0.284 | 0.018 | 0.964 |
| 849000 | 0 | 0.284 | 0.018 | 0.964 |
| 849500 | 0 | 0.284 | 0.018 | 0.964 |
| 850000 | 0 | 0.284 | 0.018 | 0.964 |
| 850500 | 0 | 0.284 | 0.018 | 0.964 |
| 851000 | 0 | 0.284 | 0.018 | 0.964 |
| 851500 | 0 | 0.282 | 0.018 | 0.965 |
| 852000 | 0 | 0.282 | 0.018 | 0.965 |
| 852500 | 0 | 0.281 | 0.018 | 0.965 |
| 853000 | 0 | 0.281 | 0.018 | 0.965 |
| 853500 | 0 | 0.28 | 0.018 | 0.965 |
| 854000 | 0 | 0.28 | 0.018 | 0.965 |
| 854500 | 0 | 0.279 | 0.018 | 0.965 |
| 855000 | 0 | 0.278 | 0.018 | 0.965 |
| 855500 | 0 | 0.278 | 0.017 | 0.965 |
| 856000 | 0 | 0.277 | 0.017 | 0.965 |
| 856500 | 0 | 0.276 | 0.017 | 0.965 |
| 857000 | 0 | 0.275 | 0.017 | 0.966 |
| 857500 | 0 | 0.275 | 0.017 | 0.966 |
| 858000 | 0 | 0.274 | 0.017 | 0.966 |
| 858500 | 0 | 0.274 | 0.017 | 0.966 |
| 859000 | 0 | 0.274 | 0.017 | 0.966 |
| 859500 | 0 | 0.274 | 0.017 | 0.966 |
| 860000 | 0 | 0.274 | 0.017 | 0.966 |
| 860500 | 0 | 0.273 | 0.017 | 0.966 |
| 861000 | 0 | 0.273 | 0.017 | 0.966 |
| 861500 | 0 | 0.271 | 0.017 | 0.966 |
| 862000 | 0 | 0.271 | 0.017 | 0.966 |
| 862500 | 0 | 0.271 | 0.017 | 0.966 |
| 863000 | 0 | 0.27 | 0.017 | 0.966 |
| 863500 | 0 | 0.27 | 0.017 | 0.966 |
| 864000 | 0 | 0.269 | 0.017 | 0.967 |
| 864500 | 0 | 0.268 | 0.017 | 0.967 |
| 865000 | 0 | 0.268 | 0.017 | 0.967 |
| 865500 | 0 | 0.267 | 0.017 | 0.967 |
| 866000 | 0 | 0.267 | 0.017 | 0.967 |
| 866500 | 0 | 0.267 | 0.017 | 0.967 |
| 867000 | 0 | 0.267 | 0.017 | 0.967 |
| 867500 | 0 | 0.267 | 0.017 | 0.967 |
| 868000 | 0 | 0.266 | 0.016 | 0.967 |
| 868500 | 0 | 0.266 | 0.016 | 0.967 |
| 869000 | 0 | 0.266 | 0.016 | 0.967 |
| 869500 | 0 | 0.266 | 0.016 | 0.967 |
| 870000 | 0 | 0.266 | 0.016 | 0.967 |
| 870500 | 0 | 0.265 | 0.016 | 0.967 |
| 871000 | 0 | 0.265 | 0.016 | 0.967 |
| 871500 | 0 | 0.265 | 0.016 | 0.967 |
| 872000 | 0 | 0.265 | 0.016 | 0.967 |
| 872500 | 0 | 0.265 | 0.016 | 0.967 |
| 873000 | 0 | 0.264 | 0.016 | 0.967 |
| 873500 | 0 | 0.263 | 0.016 | 0.967 |
| 874000 | 0 | 0.262 | 0.016 | 0.968 |
| 874500 | 0 | 0.261 | 0.016 | 0.968 |
| 875000 | 0 | 0.261 | 0.016 | 0.968 |
| 875500 | 0 | 0.261 | 0.016 | 0.968 |
| 876000 | 0 | 0.26 | 0.016 | 0.968 |
| 876500 | 0 | 0.259 | 0.016 | 0.968 |
| 877000 | 0 | 0.259 | 0.016 | 0.968 |
| 877500 | 0 | 0.259 | 0.016 | 0.968 |
| 878000 | 0 | 0.259 | 0.016 | 0.968 |
| 878500 | 0 | 0.26 | 0.016 | 0.968 |
| 879000 | 0 | 0.259 | 0.016 | 0.968 |
| 879500 | 0 | 0.259 | 0.016 | 0.968 |
| 880000 | 0 | 0.26 | 0.016 | 0.968 |
| 880500 | 0 | 0.259 | 0.016 | 0.968 |
| 881000 | 0 | 0.258 | 0.016 | 0.968 |
| 881500 | 0 | 0.258 | 0.016 | 0.968 |
| 882000 | 0 | 0.258 | 0.016 | 0.968 |
| 882500 | 0 | 0.258 | 0.016 | 0.968 |
| 883000 | 0 | 0.258 | 0.016 | 0.968 |
| 883500 | 0 | 0.258 | 0.016 | 0.968 |
| 884000 | 0 | 0.258 | 0.016 | 0.968 |
| 884500 | 0 | 0.257 | 0.016 | 0.968 |
| 885000 | 0 | 0.257 | 0.016 | 0.968 |
| 885500 | 0 | 0.257 | 0.016 | 0.968 |
| 886000 | 0 | 0.256 | 0.016 | 0.969 |
| 886500 | 0 | 0.255 | 0.016 | 0.969 |
| 887000 | 0 | 0.255 | 0.016 | 0.969 |
| 887500 | 0 | 0.255 | 0.016 | 0.969 |
| 888000 | 0 | 0.255 | 0.016 | 0.969 |
| 888500 | 0 | 0.254 | 0.016 | 0.969 |
| 889000 | 0 | 0.254 | 0.016 | 0.969 |
| 889500 | 0 | 0.254 | 0.016 | 0.969 |
| 890000 | 0 | 0.251 | 0.015 | 0.969 |
| 890500 | 0 | 0.249 | 0.015 | 0.97 |
| 891000 | 0 | 0.248 | 0.015 | 0.97 |
| 891500 | 0 | 0.247 | 0.015 | 0.97 |
| 892000 | 0 | 0.248 | 0.015 | 0.97 |
| 892500 | 0 | 0.247 | 0.015 | 0.97 |
| 893000 | 0 | 0.247 | 0.015 | 0.97 |
| 893500 | 0 | 0.246 | 0.015 | 0.97 |
| 894000 | 0 | 0.246 | 0.015 | 0.97 |
| 894500 | 0 | 0.246 | 0.015 | 0.97 |
| 895000 | 0 | 0.246 | 0.015 | 0.97 |
| 895500 | 0 | 0.246 | 0.015 | 0.97 |
| 896000 | 0 | 0.245 | 0.015 | 0.97 |
| 896500 | 0 | 0.243 | 0.015 | 0.97 |
| 897000 | 0 | 0.243 | 0.015 | 0.97 |
| 897500 | 0 | 0.243 | 0.015 | 0.97 |
| 898000 | 0 | 0.243 | 0.015 | 0.97 |
| 898500 | 0 | 0.242 | 0.015 | 0.971 |
| 899000 | 0 | 0.241 | 0.015 | 0.971 |
| 899500 | 0 | 0.241 | 0.015 | 0.971 |
| 900000 | 0 | 0.241 | 0.015 | 0.971 |
| 900500 | 0 | 0.241 | 0.015 | 0.971 |
| 901000 | 0 | 0.241 | 0.015 | 0.971 |
| 901500 | 0 | 0.24 | 0.015 | 0.971 |
| 902000 | 0 | 0.239 | 0.014 | 0.971 |
| 902500 | 0 | 0.237 | 0.014 | 0.971 |
| 903000 | 0 | 0.234 | 0.014 | 0.972 |
| 903500 | 0 | 0.234 | 0.014 | 0.972 |
| 904000 | 0 | 0.234 | 0.014 | 0.972 |
| 904500 | 0 | 0.231 | 0.014 | 0.972 |
| 905000 | 0 | 0.228 | 0.014 | 0.973 |
| 905500 | 0 | 0.228 | 0.014 | 0.973 |
| 906000 | 0 | 0.227 | 0.014 | 0.973 |
| 906500 | 0 | 0.227 | 0.014 | 0.973 |
| 907000 | 0 | 0.227 | 0.014 | 0.973 |
| 907500 | 0 | 0.227 | 0.014 | 0.973 |
| 908000 | 0 | 0.227 | 0.014 | 0.973 |
| 908500 | 0 | 0.227 | 0.014 | 0.973 |
| 909000 | 0 | 0.227 | 0.014 | 0.973 |
| 909500 | 0 | 0.227 | 0.014 | 0.973 |
| 910000 | 0 | 0.226 | 0.013 | 0.973 |
| 910500 | 0 | 0.226 | 0.014 | 0.973 |
| 911000 | 0 | 0.226 | 0.014 | 0.973 |
| 911500 | 0 | 0.226 | 0.014 | 0.973 |
| 912000 | 0 | 0.226 | 0.014 | 0.973 |
| 912500 | 0 | 0.226 | 0.013 | 0.973 |
| 913000 | 0 | 0.226 | 0.014 | 0.973 |
| 913500 | 0 | 0.226 | 0.014 | 0.973 |
| 914000 | 0 | 0.226 | 0.014 | 0.973 |
| 914500 | 0 | 0.225 | 0.014 | 0.973 |
| 915000 | 0 | 0.224 | 0.013 | 0.973 |
| 915500 | 0 | 0.224 | 0.013 | 0.973 |
| 916000 | 0 | 0.224 | 0.013 | 0.973 |
| 916500 | 0 | 0.223 | 0.013 | 0.973 |
| 917000 | 0 | 0.223 | 0.013 | 0.973 |
| 917500 | 0 | 0.222 | 0.013 | 0.974 |
| 918000 | 0 | 0.222 | 0.013 | 0.974 |
| 918500 | 0 | 0.222 | 0.013 | 0.974 |
| 919000 | 0 | 0.221 | 0.013 | 0.974 |
| 919500 | 0 | 0.221 | 0.013 | 0.974 |
| 920000 | 0 | 0.222 | 0.013 | 0.974 |
| 920500 | 0 | 0.222 | 0.013 | 0.974 |
| 921000 | 0 | 0.221 | 0.013 | 0.974 |
| 921500 | 0 | 0.22 | 0.013 | 0.974 |
| 922000 | 0 | 0.217 | 0.013 | 0.974 |
| 922500 | 0 | 0.217 | 0.013 | 0.974 |
| 923000 | 0 | 0.217 | 0.013 | 0.974 |
| 923500 | 0 | 0.217 | 0.013 | 0.974 |
| 924000 | 0 | 0.217 | 0.013 | 0.974 |
| 924500 | 0 | 0.216 | 0.013 | 0.974 |
| 925000 | 0 | 0.212 | 0.012 | 0.975 |
| 925500 | 0 | 0.21 | 0.012 | 0.975 |
| 926000 | 0 | 0.21 | 0.012 | 0.975 |
| 926500 | 0 | 0.21 | 0.012 | 0.975 |
| 927000 | 0 | 0.21 | 0.012 | 0.975 |
| 927500 | 0 | 0.208 | 0.012 | 0.976 |
| 928000 | 0 | 0.207 | 0.012 | 0.976 |
| 928500 | 0 | 0.206 | 0.012 | 0.976 |
| 929000 | 0 | 0.206 | 0.012 | 0.976 |
| 929500 | 0 | 0.206 | 0.012 | 0.976 |
| 930000 | 0 | 0.206 | 0.012 | 0.976 |
| 930500 | 0 | 0.206 | 0.012 | 0.976 |
| 931000 | 0 | 0.203 | 0.012 | 0.976 |
| 931500 | 0 | 0.202 | 0.012 | 0.976 |
| 932000 | 0 | 0.2 | 0.012 | 0.977 |
| 932500 | 0 | 0.2 | 0.012 | 0.977 |
| 933000 | 0 | 0.199 | 0.012 | 0.977 |
| 933500 | 0 | 0.196 | 0.012 | 0.977 |
| 934000 | 0 | 0.196 | 0.011 | 0.977 |
| 934500 | 0 | 0.195 | 0.011 | 0.977 |
| 935000 | 0 | 0.195 | 0.011 | 0.977 |
| 935500 | 0 | 0.195 | 0.011 | 0.977 |
| 936000 | 0 | 0.193 | 0.011 | 0.978 |
| 936500 | 0 | 0.192 | 0.011 | 0.978 |
| 937000 | 0 | 0.192 | 0.011 | 0.978 |
| 937500 | 0 | 0.189 | 0.011 | 0.978 |
| 938000 | 0 | 0.189 | 0.011 | 0.978 |
| 938500 | 0 | 0.189 | 0.011 | 0.978 |
| 939000 | 0 | 0.189 | 0.011 | 0.978 |
| 939500 | 0 | 0.189 | 0.011 | 0.978 |
| 940000 | 0 | 0.188 | 0.011 | 0.978 |
| 940500 | 0 | 0.188 | 0.011 | 0.978 |
| 941000 | 0 | 0.187 | 0.011 | 0.978 |
| 941500 | 0 | 0.185 | 0.01 | 0.979 |
| 942000 | 0 | 0.185 | 0.01 | 0.979 |
| 942500 | 0 | 0.185 | 0.011 | 0.979 |
| 943000 | 0 | 0.184 | 0.011 | 0.979 |
| 943500 | 0 | 0.184 | 0.01 | 0.979 |
| 944000 | 0 | 0.183 | 0.01 | 0.979 |
| 944500 | 0 | 0.183 | 0.01 | 0.979 |
| 945000 | 0 | 0.183 | 0.01 | 0.979 |
| 945500 | 0 | 0.182 | 0.01 | 0.979 |
| 946000 | 0 | 0.182 | 0.01 | 0.979 |
| 946500 | 0 | 0.182 | 0.01 | 0.979 |
| 947000 | 0 | 0.182 | 0.01 | 0.979 |
| 947500 | 0 | 0.182 | 0.01 | 0.979 |
| 948000 | 0 | 0.182 | 0.01 | 0.979 |
| 948500 | 0 | 0.182 | 0.01 | 0.979 |
| 949000 | 0 | 0.182 | 0.01 | 0.979 |
| 949500 | 0 | 0.182 | 0.01 | 0.979 |
| 950000 | 0 | 0.181 | 0.01 | 0.979 |
| 950500 | 0 | 0.18 | 0.01 | 0.979 |
| 951000 | 0 | 0.18 | 0.01 | 0.979 |
| 951500 | 0 | 0.18 | 0.01 | 0.979 |
| 952000 | 0 | 0.18 | 0.01 | 0.979 |
| 952500 | 0 | 0.18 | 0.01 | 0.979 |
| 953000 | 0 | 0.18 | 0.01 | 0.979 |
| 953500 | 0 | 0.18 | 0.01 | 0.979 |
| 954000 | 0 | 0.18 | 0.01 | 0.979 |
| 954500 | 0 | 0.18 | 0.01 | 0.979 |
| 955000 | 0 | 0.179 | 0.01 | 0.98 |
| 955500 | 0 | 0.179 | 0.01 | 0.98 |
| 956000 | 0 | 0.179 | 0.01 | 0.98 |
| 956500 | 0 | 0.179 | 0.01 | 0.98 |
| 957000 | 0 | 0.177 | 0.01 | 0.98 |
| 957500 | 0 | 0.177 | 0.01 | 0.98 |
| 958000 | 0 | 0.177 | 0.01 | 0.98 |
| 958500 | 0 | 0.177 | 0.01 | 0.98 |
| 959000 | 0 | 0.176 | 0.01 | 0.98 |
| 959500 | 0 | 0.176 | 0.01 | 0.98 |
| 960000 | 0 | 0.176 | 0.01 | 0.98 |
| 960500 | 0 | 0.176 | 0.01 | 0.98 |
| 961000 | 0 | 0.176 | 0.01 | 0.98 |
| 961500 | 0 | 0.176 | 0.01 | 0.98 |
| 962000 | 0 | 0.176 | 0.01 | 0.98 |
| 962500 | 0 | 0.174 | 0.01 | 0.98 |
| 963000 | 0 | 0.173 | 0.01 | 0.98 |
| 963500 | 0 | 0.173 | 0.01 | 0.98 |
| 964000 | 0 | 0.173 | 0.01 | 0.98 |
| 964500 | 0 | 0.173 | 0.01 | 0.98 |
| 965000 | 0 | 0.173 | 0.01 | 0.98 |
| 965500 | 0 | 0.173 | 0.01 | 0.98 |
| 966000 | 0 | 0.173 | 0.01 | 0.98 |
| 966500 | 0 | 0.173 | 0.01 | 0.98 |
| 967000 | 0 | 0.173 | 0.01 | 0.98 |
| 967500 | 0 | 0.173 | 0.01 | 0.98 |
| 968000 | 0 | 0.173 | 0.01 | 0.98 |
| 968500 | 0 | 0.173 | 0.01 | 0.98 |
| 969000 | 0 | 0.173 | 0.01 | 0.98 |
| 969500 | 0 | 0.173 | 0.01 | 0.98 |
| 970000 | 0 | 0.173 | 0.01 | 0.98 |
| 970500 | 0 | 0.173 | 0.01 | 0.98 |
| 971000 | 0 | 0.172 | 0.01 | 0.981 |
| 971500 | 0 | 0.172 | 0.01 | 0.981 |
| 972000 | 0 | 0.172 | 0.01 | 0.981 |
| 972500 | 0 | 0.172 | 0.01 | 0.981 |
| 973000 | 0 | 0.172 | 0.01 | 0.981 |
| 973500 | 0 | 0.172 | 0.01 | 0.981 |
| 974000 | 0 | 0.171 | 0.01 | 0.981 |
| 974500 | 0 | 0.171 | 0.01 | 0.981 |
| 975000 | 0 | 0.17 | 0.01 | 0.981 |
| 975500 | 0 | 0.17 | 0.01 | 0.981 |
| 976000 | 0 | 0.17 | 0.01 | 0.981 |
| 976500 | 0 | 0.169 | 0.01 | 0.981 |
| 977000 | 0 | 0.168 | 0.01 | 0.981 |
| 977500 | 0 | 0.168 | 0.01 | 0.981 |
| 978000 | 0 | 0.168 | 0.01 | 0.981 |
| 978500 | 0 | 0.167 | 0.009 | 0.981 |
| 979000 | 0 | 0.167 | 0.009 | 0.981 |
| 979500 | 0 | 0.167 | 0.009 | 0.981 |
| 980000 | 0 | 0.164 | 0.009 | 0.982 |
| 980500 | 0 | 0.163 | 0.009 | 0.982 |
| 981000 | 0 | 0.163 | 0.009 | 0.982 |
| 981500 | 0 | 0.162 | 0.009 | 0.982 |
| 982000 | 0 | 0.163 | 0.009 | 0.982 |
| 982500 | 0 | 0.163 | 0.009 | 0.982 |
| 983000 | 0 | 0.162 | 0.009 | 0.982 |
| 983500 | 0 | 0.162 | 0.009 | 0.982 |
| 984000 | 0 | 0.162 | 0.009 | 0.982 |
| 984500 | 0 | 0.162 | 0.009 | 0.982 |
| 985000 | 0 | 0.163 | 0.009 | 0.982 |
| 985500 | 0 | 0.162 | 0.009 | 0.982 |
| 986000 | 0 | 0.162 | 0.009 | 0.982 |
| 986500 | 0 | 0.163 | 0.009 | 0.982 |
| 987000 | 0 | 0.163 | 0.009 | 0.982 |
| 987500 | 0 | 0.163 | 0.009 | 0.982 |
| 988000 | 0 | 0.163 | 0.009 | 0.982 |
| 988500 | 0 | 0.162 | 0.009 | 0.982 |
| 989000 | 0 | 0.161 | 0.009 | 0.982 |
| 989500 | 0 | 0.161 | 0.009 | 0.982 |
| 990000 | 0 | 0.161 | 0.009 | 0.982 |
| 990500 | 0 | 0.161 | 0.009 | 0.982 |
| 991000 | 0 | 0.161 | 0.009 | 0.982 |
| 991500 | 0 | 0.161 | 0.009 | 0.982 |
| 992000 | 0 | 0.161 | 0.009 | 0.982 |
| 992500 | 0 | 0.161 | 0.009 | 0.982 |
| 993000 | 0 | 0.161 | 0.009 | 0.982 |
| 993500 | 0 | 0.161 | 0.009 | 0.982 |
| 994000 | 0 | 0.161 | 0.009 | 0.982 |
| 994500 | 0 | 0.16 | 0.009 | 0.982 |
| 995000 | 0 | 0.158 | 0.009 | 0.982 |
| 995500 | 0 | 0.158 | 0.009 | 0.982 |
| 996000 | 0 | 0.158 | 0.009 | 0.982 |
| 996500 | 0 | 0.158 | 0.009 | 0.982 |
| 997000 | 0 | 0.158 | 0.009 | 0.982 |
| 997500 | 0 | 0.158 | 0.009 | 0.982 |
| 998000 | 0 | 0.158 | 0.009 | 0.982 |
| 998500 | 0 | 0.158 | 0.009 | 0.982 |
| 999000 | 0 | 0.157 | 0.009 | 0.983 |